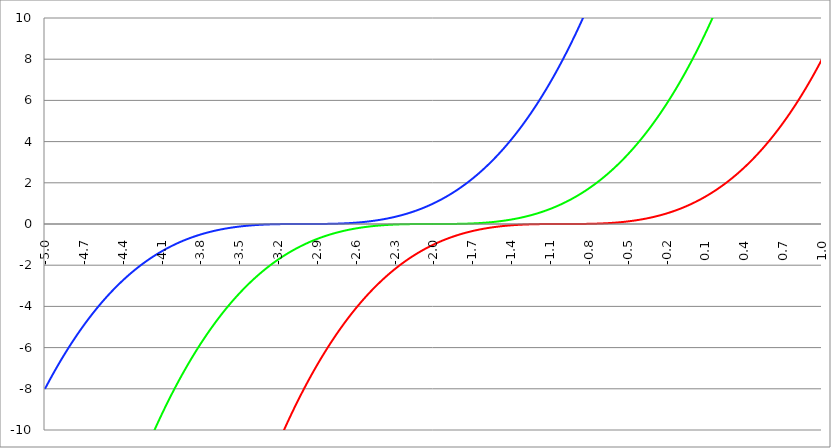
| Category | Series 1 | Series 0 | Series 2 |
|---|---|---|---|
| -5.0 | -64 | -27 | -8 |
| -4.997 | -63.856 | -26.919 | -7.964 |
| -4.994 | -63.712 | -26.838 | -7.928 |
| -4.991 | -63.569 | -26.758 | -7.892 |
| -4.988 | -63.426 | -26.677 | -7.857 |
| -4.984999999999999 | -63.283 | -26.597 | -7.821 |
| -4.982 | -63.14 | -26.517 | -7.786 |
| -4.979 | -62.997 | -26.437 | -7.751 |
| -4.976 | -62.855 | -26.357 | -7.715 |
| -4.972999999999999 | -62.713 | -26.278 | -7.68 |
| -4.969999999999999 | -62.571 | -26.198 | -7.645 |
| -4.966999999999999 | -62.429 | -26.119 | -7.61 |
| -4.963999999999999 | -62.288 | -26.04 | -7.576 |
| -4.960999999999998 | -62.146 | -25.961 | -7.541 |
| -4.957999999999998 | -62.005 | -25.882 | -7.507 |
| -4.954999999999998 | -61.864 | -25.803 | -7.472 |
| -4.951999999999998 | -61.724 | -25.725 | -7.438 |
| -4.948999999999998 | -61.583 | -25.646 | -7.403 |
| -4.945999999999998 | -61.443 | -25.568 | -7.369 |
| -4.942999999999998 | -61.303 | -25.49 | -7.335 |
| -4.939999999999997 | -61.163 | -25.412 | -7.301 |
| -4.936999999999997 | -61.023 | -25.334 | -7.268 |
| -4.933999999999997 | -60.884 | -25.257 | -7.234 |
| -4.930999999999997 | -60.745 | -25.18 | -7.2 |
| -4.927999999999997 | -60.606 | -25.102 | -7.167 |
| -4.924999999999997 | -60.467 | -25.025 | -7.133 |
| -4.921999999999997 | -60.329 | -24.948 | -7.1 |
| -4.918999999999997 | -60.19 | -24.872 | -7.067 |
| -4.915999999999997 | -60.052 | -24.795 | -7.034 |
| -4.912999999999997 | -59.914 | -24.718 | -7.001 |
| -4.909999999999996 | -59.776 | -24.642 | -6.968 |
| -4.906999999999996 | -59.639 | -24.566 | -6.935 |
| -4.903999999999996 | -59.502 | -24.49 | -6.902 |
| -4.900999999999996 | -59.365 | -24.414 | -6.87 |
| -4.897999999999996 | -59.228 | -24.339 | -6.837 |
| -4.894999999999996 | -59.091 | -24.263 | -6.805 |
| -4.891999999999996 | -58.955 | -24.188 | -6.773 |
| -4.888999999999996 | -58.818 | -24.113 | -6.741 |
| -4.885999999999996 | -58.682 | -24.037 | -6.708 |
| -4.882999999999996 | -58.547 | -23.963 | -6.677 |
| -4.879999999999995 | -58.411 | -23.888 | -6.645 |
| -4.876999999999995 | -58.276 | -23.813 | -6.613 |
| -4.873999999999995 | -58.141 | -23.739 | -6.581 |
| -4.870999999999995 | -58.006 | -23.665 | -6.55 |
| -4.867999999999995 | -57.871 | -23.591 | -6.518 |
| -4.864999999999995 | -57.736 | -23.517 | -6.487 |
| -4.861999999999995 | -57.602 | -23.443 | -6.456 |
| -4.858999999999995 | -57.468 | -23.369 | -6.424 |
| -4.855999999999994 | -57.334 | -23.296 | -6.393 |
| -4.852999999999994 | -57.2 | -23.222 | -6.362 |
| -4.849999999999994 | -57.067 | -23.149 | -6.332 |
| -4.846999999999994 | -56.933 | -23.076 | -6.301 |
| -4.843999999999994 | -56.8 | -23.003 | -6.27 |
| -4.840999999999994 | -56.667 | -22.931 | -6.24 |
| -4.837999999999994 | -56.535 | -22.858 | -6.209 |
| -4.834999999999994 | -56.402 | -22.786 | -6.179 |
| -4.831999999999994 | -56.27 | -22.713 | -6.149 |
| -4.828999999999993 | -56.138 | -22.641 | -6.118 |
| -4.825999999999993 | -56.006 | -22.569 | -6.088 |
| -4.822999999999993 | -55.874 | -22.497 | -6.058 |
| -4.819999999999993 | -55.743 | -22.426 | -6.029 |
| -4.816999999999993 | -55.612 | -22.354 | -5.999 |
| -4.813999999999993 | -55.481 | -22.283 | -5.969 |
| -4.810999999999993 | -55.35 | -22.212 | -5.94 |
| -4.807999999999993 | -55.219 | -22.141 | -5.91 |
| -4.804999999999993 | -55.089 | -22.07 | -5.881 |
| -4.801999999999992 | -54.959 | -21.999 | -5.851 |
| -4.798999999999992 | -54.829 | -21.928 | -5.822 |
| -4.795999999999992 | -54.699 | -21.858 | -5.793 |
| -4.792999999999992 | -54.569 | -21.788 | -5.764 |
| -4.789999999999992 | -54.44 | -21.718 | -5.735 |
| -4.786999999999992 | -54.311 | -21.648 | -5.707 |
| -4.783999999999992 | -54.182 | -21.578 | -5.678 |
| -4.780999999999992 | -54.053 | -21.508 | -5.649 |
| -4.777999999999992 | -53.924 | -21.439 | -5.621 |
| -4.774999999999991 | -53.796 | -21.369 | -5.592 |
| -4.771999999999991 | -53.668 | -21.3 | -5.564 |
| -4.768999999999991 | -53.54 | -21.231 | -5.536 |
| -4.765999999999991 | -53.412 | -21.162 | -5.508 |
| -4.762999999999991 | -53.285 | -21.093 | -5.48 |
| -4.759999999999991 | -53.157 | -21.025 | -5.452 |
| -4.756999999999991 | -53.03 | -20.956 | -5.424 |
| -4.753999999999991 | -52.903 | -20.888 | -5.396 |
| -4.75099999999999 | -52.777 | -20.82 | -5.369 |
| -4.74799999999999 | -52.65 | -20.752 | -5.341 |
| -4.74499999999999 | -52.524 | -20.684 | -5.314 |
| -4.74199999999999 | -52.398 | -20.616 | -5.286 |
| -4.73899999999999 | -52.272 | -20.548 | -5.259 |
| -4.73599999999999 | -52.146 | -20.481 | -5.232 |
| -4.73299999999999 | -52.02 | -20.414 | -5.205 |
| -4.72999999999999 | -51.895 | -20.346 | -5.178 |
| -4.72699999999999 | -51.77 | -20.279 | -5.151 |
| -4.723999999999989 | -51.645 | -20.213 | -5.124 |
| -4.720999999999989 | -51.52 | -20.146 | -5.097 |
| -4.717999999999989 | -51.396 | -20.079 | -5.071 |
| -4.714999999999989 | -51.272 | -20.013 | -5.044 |
| -4.71199999999999 | -51.147 | -19.947 | -5.018 |
| -4.708999999999989 | -51.024 | -19.88 | -4.991 |
| -4.705999999999989 | -50.9 | -19.815 | -4.965 |
| -4.702999999999989 | -50.776 | -19.749 | -4.939 |
| -4.699999999999989 | -50.653 | -19.683 | -4.913 |
| -4.696999999999988 | -50.53 | -19.617 | -4.887 |
| -4.693999999999988 | -50.407 | -19.552 | -4.861 |
| -4.690999999999988 | -50.284 | -19.487 | -4.835 |
| -4.687999999999988 | -50.162 | -19.422 | -4.81 |
| -4.684999999999988 | -50.039 | -19.357 | -4.784 |
| -4.681999999999988 | -49.917 | -19.292 | -4.759 |
| -4.678999999999988 | -49.795 | -19.227 | -4.733 |
| -4.675999999999988 | -49.674 | -19.163 | -4.708 |
| -4.672999999999988 | -49.552 | -19.098 | -4.683 |
| -4.669999999999987 | -49.431 | -19.034 | -4.657 |
| -4.666999999999987 | -49.31 | -18.97 | -4.632 |
| -4.663999999999987 | -49.189 | -18.906 | -4.607 |
| -4.660999999999987 | -49.068 | -18.842 | -4.583 |
| -4.657999999999987 | -48.948 | -18.779 | -4.558 |
| -4.654999999999987 | -48.827 | -18.715 | -4.533 |
| -4.651999999999987 | -48.707 | -18.652 | -4.508 |
| -4.648999999999987 | -48.587 | -18.589 | -4.484 |
| -4.645999999999986 | -48.467 | -18.525 | -4.46 |
| -4.642999999999986 | -48.348 | -18.463 | -4.435 |
| -4.639999999999986 | -48.229 | -18.4 | -4.411 |
| -4.636999999999986 | -48.109 | -18.337 | -4.387 |
| -4.633999999999986 | -47.99 | -18.275 | -4.363 |
| -4.630999999999986 | -47.872 | -18.212 | -4.339 |
| -4.627999999999986 | -47.753 | -18.15 | -4.315 |
| -4.624999999999986 | -47.635 | -18.088 | -4.291 |
| -4.621999999999986 | -47.517 | -18.026 | -4.267 |
| -4.618999999999985 | -47.399 | -17.964 | -4.244 |
| -4.615999999999985 | -47.281 | -17.902 | -4.22 |
| -4.612999999999985 | -47.163 | -17.841 | -4.197 |
| -4.609999999999985 | -47.046 | -17.78 | -4.173 |
| -4.606999999999985 | -46.929 | -17.718 | -4.15 |
| -4.603999999999985 | -46.812 | -17.657 | -4.127 |
| -4.600999999999985 | -46.695 | -17.596 | -4.104 |
| -4.597999999999985 | -46.578 | -17.535 | -4.081 |
| -4.594999999999985 | -46.462 | -17.475 | -4.058 |
| -4.591999999999984 | -46.346 | -17.414 | -4.035 |
| -4.588999999999984 | -46.23 | -17.354 | -4.012 |
| -4.585999999999984 | -46.114 | -17.294 | -3.989 |
| -4.582999999999984 | -45.998 | -17.233 | -3.967 |
| -4.579999999999984 | -45.883 | -17.174 | -3.944 |
| -4.576999999999984 | -45.767 | -17.114 | -3.922 |
| -4.573999999999984 | -45.652 | -17.054 | -3.9 |
| -4.570999999999984 | -45.538 | -16.994 | -3.877 |
| -4.567999999999984 | -45.423 | -16.935 | -3.855 |
| -4.564999999999984 | -45.308 | -16.876 | -3.833 |
| -4.561999999999983 | -45.194 | -16.817 | -3.811 |
| -4.558999999999983 | -45.08 | -16.758 | -3.789 |
| -4.555999999999983 | -44.966 | -16.699 | -3.767 |
| -4.552999999999983 | -44.852 | -16.64 | -3.746 |
| -4.549999999999983 | -44.739 | -16.581 | -3.724 |
| -4.546999999999983 | -44.626 | -16.523 | -3.702 |
| -4.543999999999983 | -44.512 | -16.465 | -3.681 |
| -4.540999999999983 | -44.399 | -16.406 | -3.659 |
| -4.537999999999982 | -44.287 | -16.348 | -3.638 |
| -4.534999999999982 | -44.174 | -16.29 | -3.617 |
| -4.531999999999982 | -44.062 | -16.233 | -3.596 |
| -4.528999999999982 | -43.95 | -16.175 | -3.575 |
| -4.525999999999982 | -43.838 | -16.118 | -3.554 |
| -4.522999999999982 | -43.726 | -16.06 | -3.533 |
| -4.519999999999982 | -43.614 | -16.003 | -3.512 |
| -4.516999999999982 | -43.503 | -15.946 | -3.491 |
| -4.513999999999982 | -43.392 | -15.889 | -3.47 |
| -4.510999999999981 | -43.281 | -15.832 | -3.45 |
| -4.507999999999981 | -43.17 | -15.775 | -3.429 |
| -4.504999999999981 | -43.059 | -15.719 | -3.409 |
| -4.501999999999981 | -42.949 | -15.663 | -3.389 |
| -4.498999999999981 | -42.838 | -15.606 | -3.368 |
| -4.495999999999981 | -42.728 | -15.55 | -3.348 |
| -4.492999999999981 | -42.618 | -15.494 | -3.328 |
| -4.48999999999998 | -42.509 | -15.438 | -3.308 |
| -4.48699999999998 | -42.399 | -15.383 | -3.288 |
| -4.48399999999998 | -42.29 | -15.327 | -3.268 |
| -4.48099999999998 | -42.181 | -15.271 | -3.248 |
| -4.47799999999998 | -42.072 | -15.216 | -3.229 |
| -4.47499999999998 | -41.963 | -15.161 | -3.209 |
| -4.47199999999998 | -41.854 | -15.106 | -3.19 |
| -4.46899999999998 | -41.746 | -15.051 | -3.17 |
| -4.46599999999998 | -41.638 | -14.996 | -3.151 |
| -4.46299999999998 | -41.53 | -14.941 | -3.131 |
| -4.45999999999998 | -41.422 | -14.887 | -3.112 |
| -4.45699999999998 | -41.314 | -14.833 | -3.093 |
| -4.45399999999998 | -41.207 | -14.778 | -3.074 |
| -4.45099999999998 | -41.099 | -14.724 | -3.055 |
| -4.44799999999998 | -40.992 | -14.67 | -3.036 |
| -4.444999999999979 | -40.885 | -14.616 | -3.017 |
| -4.441999999999978 | -40.779 | -14.563 | -2.998 |
| -4.438999999999978 | -40.672 | -14.509 | -2.98 |
| -4.435999999999978 | -40.566 | -14.455 | -2.961 |
| -4.432999999999978 | -40.46 | -14.402 | -2.943 |
| -4.429999999999978 | -40.354 | -14.349 | -2.924 |
| -4.426999999999978 | -40.248 | -14.296 | -2.906 |
| -4.423999999999978 | -40.142 | -14.243 | -2.888 |
| -4.420999999999978 | -40.037 | -14.19 | -2.869 |
| -4.417999999999978 | -39.932 | -14.137 | -2.851 |
| -4.414999999999978 | -39.826 | -14.085 | -2.833 |
| -4.411999999999977 | -39.722 | -14.032 | -2.815 |
| -4.408999999999977 | -39.617 | -13.98 | -2.797 |
| -4.405999999999977 | -39.512 | -13.928 | -2.779 |
| -4.402999999999977 | -39.408 | -13.876 | -2.762 |
| -4.399999999999977 | -39.304 | -13.824 | -2.744 |
| -4.396999999999977 | -39.2 | -13.772 | -2.726 |
| -4.393999999999977 | -39.096 | -13.721 | -2.709 |
| -4.390999999999977 | -38.993 | -13.669 | -2.691 |
| -4.387999999999977 | -38.889 | -13.618 | -2.674 |
| -4.384999999999977 | -38.786 | -13.566 | -2.657 |
| -4.381999999999976 | -38.683 | -13.515 | -2.64 |
| -4.378999999999976 | -38.58 | -13.464 | -2.622 |
| -4.375999999999976 | -38.478 | -13.413 | -2.605 |
| -4.372999999999976 | -38.375 | -13.363 | -2.588 |
| -4.369999999999976 | -38.273 | -13.312 | -2.571 |
| -4.366999999999976 | -38.171 | -13.262 | -2.554 |
| -4.363999999999976 | -38.069 | -13.211 | -2.538 |
| -4.360999999999976 | -37.967 | -13.161 | -2.521 |
| -4.357999999999976 | -37.865 | -13.111 | -2.504 |
| -4.354999999999976 | -37.764 | -13.061 | -2.488 |
| -4.351999999999975 | -37.663 | -13.011 | -2.471 |
| -4.348999999999975 | -37.562 | -12.961 | -2.455 |
| -4.345999999999975 | -37.461 | -12.912 | -2.439 |
| -4.342999999999975 | -37.36 | -12.862 | -2.422 |
| -4.339999999999974 | -37.26 | -12.813 | -2.406 |
| -4.336999999999974 | -37.159 | -12.764 | -2.39 |
| -4.333999999999974 | -37.059 | -12.715 | -2.374 |
| -4.330999999999974 | -36.959 | -12.666 | -2.358 |
| -4.327999999999974 | -36.86 | -12.617 | -2.342 |
| -4.324999999999974 | -36.76 | -12.568 | -2.326 |
| -4.321999999999974 | -36.661 | -12.519 | -2.31 |
| -4.318999999999974 | -36.561 | -12.471 | -2.295 |
| -4.315999999999974 | -36.462 | -12.423 | -2.279 |
| -4.312999999999974 | -36.363 | -12.374 | -2.264 |
| -4.309999999999974 | -36.265 | -12.326 | -2.248 |
| -4.306999999999974 | -36.166 | -12.278 | -2.233 |
| -4.303999999999974 | -36.068 | -12.231 | -2.217 |
| -4.300999999999973 | -35.97 | -12.183 | -2.202 |
| -4.297999999999973 | -35.872 | -12.135 | -2.187 |
| -4.294999999999973 | -35.774 | -12.088 | -2.172 |
| -4.291999999999973 | -35.676 | -12.04 | -2.157 |
| -4.288999999999973 | -35.579 | -11.993 | -2.142 |
| -4.285999999999973 | -35.482 | -11.946 | -2.127 |
| -4.282999999999973 | -35.384 | -11.899 | -2.112 |
| -4.279999999999972 | -35.288 | -11.852 | -2.097 |
| -4.276999999999972 | -35.191 | -11.806 | -2.082 |
| -4.273999999999972 | -35.094 | -11.759 | -2.068 |
| -4.270999999999972 | -34.998 | -11.713 | -2.053 |
| -4.267999999999972 | -34.902 | -11.666 | -2.039 |
| -4.264999999999972 | -34.806 | -11.62 | -2.024 |
| -4.261999999999972 | -34.71 | -11.574 | -2.01 |
| -4.258999999999972 | -34.614 | -11.528 | -1.996 |
| -4.255999999999972 | -34.519 | -11.482 | -1.981 |
| -4.252999999999972 | -34.423 | -11.436 | -1.967 |
| -4.249999999999971 | -34.328 | -11.391 | -1.953 |
| -4.246999999999971 | -34.233 | -11.345 | -1.939 |
| -4.243999999999971 | -34.138 | -11.3 | -1.925 |
| -4.240999999999971 | -34.044 | -11.254 | -1.911 |
| -4.237999999999971 | -33.949 | -11.209 | -1.897 |
| -4.234999999999971 | -33.855 | -11.164 | -1.884 |
| -4.23199999999997 | -33.761 | -11.119 | -1.87 |
| -4.228999999999971 | -33.667 | -11.075 | -1.856 |
| -4.225999999999971 | -33.573 | -11.03 | -1.843 |
| -4.222999999999971 | -33.48 | -10.985 | -1.829 |
| -4.21999999999997 | -33.386 | -10.941 | -1.816 |
| -4.21699999999997 | -33.293 | -10.897 | -1.802 |
| -4.21399999999997 | -33.2 | -10.853 | -1.789 |
| -4.21099999999997 | -33.107 | -10.809 | -1.776 |
| -4.20799999999997 | -33.014 | -10.765 | -1.763 |
| -4.20499999999997 | -32.922 | -10.721 | -1.75 |
| -4.20199999999997 | -32.829 | -10.677 | -1.737 |
| -4.19899999999997 | -32.737 | -10.633 | -1.724 |
| -4.19599999999997 | -32.645 | -10.59 | -1.711 |
| -4.192999999999969 | -32.553 | -10.547 | -1.698 |
| -4.18999999999997 | -32.462 | -10.503 | -1.685 |
| -4.18699999999997 | -32.37 | -10.46 | -1.672 |
| -4.18399999999997 | -32.279 | -10.417 | -1.66 |
| -4.180999999999969 | -32.188 | -10.374 | -1.647 |
| -4.177999999999969 | -32.097 | -10.332 | -1.635 |
| -4.174999999999969 | -32.006 | -10.289 | -1.622 |
| -4.171999999999968 | -31.915 | -10.247 | -1.61 |
| -4.168999999999968 | -31.825 | -10.204 | -1.598 |
| -4.165999999999968 | -31.735 | -10.162 | -1.585 |
| -4.162999999999968 | -31.644 | -10.12 | -1.573 |
| -4.159999999999968 | -31.554 | -10.078 | -1.561 |
| -4.156999999999968 | -31.465 | -10.036 | -1.549 |
| -4.153999999999968 | -31.375 | -9.994 | -1.537 |
| -4.150999999999968 | -31.286 | -9.952 | -1.525 |
| -4.147999999999968 | -31.196 | -9.911 | -1.513 |
| -4.144999999999968 | -31.107 | -9.869 | -1.501 |
| -4.141999999999967 | -31.018 | -9.828 | -1.489 |
| -4.138999999999967 | -30.93 | -9.787 | -1.478 |
| -4.135999999999967 | -30.841 | -9.745 | -1.466 |
| -4.132999999999967 | -30.753 | -9.704 | -1.454 |
| -4.129999999999967 | -30.664 | -9.664 | -1.443 |
| -4.126999999999967 | -30.576 | -9.623 | -1.431 |
| -4.123999999999967 | -30.488 | -9.582 | -1.42 |
| -4.120999999999967 | -30.401 | -9.542 | -1.409 |
| -4.117999999999967 | -30.313 | -9.501 | -1.397 |
| -4.114999999999966 | -30.226 | -9.461 | -1.386 |
| -4.111999999999966 | -30.138 | -9.421 | -1.375 |
| -4.108999999999966 | -30.051 | -9.381 | -1.364 |
| -4.105999999999966 | -29.964 | -9.341 | -1.353 |
| -4.102999999999966 | -29.878 | -9.301 | -1.342 |
| -4.099999999999965 | -29.791 | -9.261 | -1.331 |
| -4.096999999999965 | -29.705 | -9.221 | -1.32 |
| -4.093999999999965 | -29.618 | -9.182 | -1.309 |
| -4.090999999999965 | -29.532 | -9.142 | -1.299 |
| -4.087999999999965 | -29.446 | -9.103 | -1.288 |
| -4.084999999999965 | -29.361 | -9.064 | -1.277 |
| -4.081999999999965 | -29.275 | -9.025 | -1.267 |
| -4.078999999999965 | -29.19 | -8.986 | -1.256 |
| -4.075999999999964 | -29.104 | -8.947 | -1.246 |
| -4.072999999999964 | -29.019 | -8.908 | -1.235 |
| -4.069999999999964 | -28.934 | -8.87 | -1.225 |
| -4.066999999999964 | -28.85 | -8.831 | -1.215 |
| -4.063999999999964 | -28.765 | -8.793 | -1.205 |
| -4.060999999999964 | -28.681 | -8.755 | -1.194 |
| -4.057999999999964 | -28.596 | -8.716 | -1.184 |
| -4.054999999999964 | -28.512 | -8.678 | -1.174 |
| -4.051999999999964 | -28.428 | -8.64 | -1.164 |
| -4.048999999999964 | -28.345 | -8.603 | -1.154 |
| -4.045999999999964 | -28.261 | -8.565 | -1.144 |
| -4.042999999999964 | -28.178 | -8.527 | -1.135 |
| -4.039999999999963 | -28.094 | -8.49 | -1.125 |
| -4.036999999999963 | -28.011 | -8.452 | -1.115 |
| -4.033999999999963 | -27.928 | -8.415 | -1.106 |
| -4.030999999999963 | -27.846 | -8.378 | -1.096 |
| -4.027999999999963 | -27.763 | -8.341 | -1.086 |
| -4.024999999999963 | -27.681 | -8.304 | -1.077 |
| -4.021999999999963 | -27.598 | -8.267 | -1.067 |
| -4.018999999999963 | -27.516 | -8.23 | -1.058 |
| -4.015999999999963 | -27.434 | -8.194 | -1.049 |
| -4.012999999999963 | -27.353 | -8.157 | -1.04 |
| -4.009999999999962 | -27.271 | -8.121 | -1.03 |
| -4.006999999999962 | -27.189 | -8.084 | -1.021 |
| -4.003999999999962 | -27.108 | -8.048 | -1.012 |
| -4.000999999999962 | -27.027 | -8.012 | -1.003 |
| -3.997999999999962 | -26.946 | -7.976 | -0.994 |
| -3.994999999999962 | -26.865 | -7.94 | -0.985 |
| -3.991999999999962 | -26.785 | -7.904 | -0.976 |
| -3.988999999999962 | -26.704 | -7.869 | -0.967 |
| -3.985999999999962 | -26.624 | -7.833 | -0.959 |
| -3.982999999999961 | -26.544 | -7.798 | -0.95 |
| -3.979999999999961 | -26.464 | -7.762 | -0.941 |
| -3.976999999999961 | -26.384 | -7.727 | -0.933 |
| -3.973999999999961 | -26.304 | -7.692 | -0.924 |
| -3.970999999999961 | -26.225 | -7.657 | -0.915 |
| -3.967999999999961 | -26.145 | -7.622 | -0.907 |
| -3.964999999999961 | -26.066 | -7.587 | -0.899 |
| -3.961999999999961 | -25.987 | -7.553 | -0.89 |
| -3.958999999999961 | -25.908 | -7.518 | -0.882 |
| -3.95599999999996 | -25.829 | -7.484 | -0.874 |
| -3.95299999999996 | -25.751 | -7.449 | -0.866 |
| -3.94999999999996 | -25.672 | -7.415 | -0.857 |
| -3.94699999999996 | -25.594 | -7.381 | -0.849 |
| -3.94399999999996 | -25.516 | -7.347 | -0.841 |
| -3.94099999999996 | -25.438 | -7.313 | -0.833 |
| -3.93799999999996 | -25.36 | -7.279 | -0.825 |
| -3.93499999999996 | -25.283 | -7.245 | -0.817 |
| -3.931999999999959 | -25.205 | -7.211 | -0.81 |
| -3.928999999999959 | -25.128 | -7.178 | -0.802 |
| -3.925999999999959 | -25.051 | -7.144 | -0.794 |
| -3.922999999999959 | -24.974 | -7.111 | -0.786 |
| -3.919999999999959 | -24.897 | -7.078 | -0.779 |
| -3.916999999999959 | -24.82 | -7.045 | -0.771 |
| -3.913999999999959 | -24.744 | -7.012 | -0.764 |
| -3.910999999999959 | -24.668 | -6.979 | -0.756 |
| -3.907999999999959 | -24.591 | -6.946 | -0.749 |
| -3.904999999999958 | -24.515 | -6.913 | -0.741 |
| -3.901999999999958 | -24.439 | -6.881 | -0.734 |
| -3.898999999999958 | -24.364 | -6.848 | -0.727 |
| -3.895999999999958 | -24.288 | -6.816 | -0.719 |
| -3.892999999999958 | -24.213 | -6.783 | -0.712 |
| -3.889999999999958 | -24.138 | -6.751 | -0.705 |
| -3.886999999999958 | -24.062 | -6.719 | -0.698 |
| -3.883999999999958 | -23.988 | -6.687 | -0.691 |
| -3.880999999999958 | -23.913 | -6.655 | -0.684 |
| -3.877999999999957 | -23.838 | -6.623 | -0.677 |
| -3.874999999999957 | -23.764 | -6.592 | -0.67 |
| -3.871999999999957 | -23.689 | -6.56 | -0.663 |
| -3.868999999999957 | -23.615 | -6.529 | -0.656 |
| -3.865999999999957 | -23.541 | -6.497 | -0.649 |
| -3.862999999999957 | -23.467 | -6.466 | -0.643 |
| -3.859999999999957 | -23.394 | -6.435 | -0.636 |
| -3.856999999999957 | -23.32 | -6.404 | -0.629 |
| -3.853999999999957 | -23.247 | -6.373 | -0.623 |
| -3.850999999999956 | -23.174 | -6.342 | -0.616 |
| -3.847999999999956 | -23.1 | -6.311 | -0.61 |
| -3.844999999999956 | -23.028 | -6.28 | -0.603 |
| -3.841999999999956 | -22.955 | -6.25 | -0.597 |
| -3.838999999999956 | -22.882 | -6.219 | -0.591 |
| -3.835999999999956 | -22.81 | -6.189 | -0.584 |
| -3.832999999999956 | -22.737 | -6.159 | -0.578 |
| -3.829999999999956 | -22.665 | -6.128 | -0.572 |
| -3.826999999999955 | -22.593 | -6.098 | -0.566 |
| -3.823999999999955 | -22.521 | -6.068 | -0.559 |
| -3.820999999999955 | -22.45 | -6.039 | -0.553 |
| -3.817999999999955 | -22.378 | -6.009 | -0.547 |
| -3.814999999999955 | -22.307 | -5.979 | -0.541 |
| -3.811999999999955 | -22.235 | -5.949 | -0.535 |
| -3.808999999999955 | -22.164 | -5.92 | -0.529 |
| -3.805999999999955 | -22.093 | -5.891 | -0.524 |
| -3.802999999999955 | -22.023 | -5.861 | -0.518 |
| -3.799999999999954 | -21.952 | -5.832 | -0.512 |
| -3.796999999999954 | -21.882 | -5.803 | -0.506 |
| -3.793999999999954 | -21.811 | -5.774 | -0.501 |
| -3.790999999999954 | -21.741 | -5.745 | -0.495 |
| -3.787999999999954 | -21.671 | -5.716 | -0.489 |
| -3.784999999999954 | -21.601 | -5.687 | -0.484 |
| -3.781999999999954 | -21.531 | -5.659 | -0.478 |
| -3.778999999999954 | -21.462 | -5.63 | -0.473 |
| -3.775999999999954 | -21.392 | -5.602 | -0.467 |
| -3.772999999999953 | -21.323 | -5.573 | -0.462 |
| -3.769999999999953 | -21.254 | -5.545 | -0.457 |
| -3.766999999999953 | -21.185 | -5.517 | -0.451 |
| -3.763999999999953 | -21.116 | -5.489 | -0.446 |
| -3.760999999999953 | -21.047 | -5.461 | -0.441 |
| -3.757999999999953 | -20.979 | -5.433 | -0.436 |
| -3.754999999999953 | -20.911 | -5.405 | -0.43 |
| -3.751999999999953 | -20.842 | -5.378 | -0.425 |
| -3.748999999999952 | -20.774 | -5.35 | -0.42 |
| -3.745999999999952 | -20.706 | -5.323 | -0.415 |
| -3.742999999999952 | -20.638 | -5.295 | -0.41 |
| -3.739999999999952 | -20.571 | -5.268 | -0.405 |
| -3.736999999999952 | -20.503 | -5.241 | -0.4 |
| -3.733999999999952 | -20.436 | -5.214 | -0.395 |
| -3.730999999999952 | -20.369 | -5.187 | -0.391 |
| -3.727999999999952 | -20.302 | -5.16 | -0.386 |
| -3.724999999999952 | -20.235 | -5.133 | -0.381 |
| -3.721999999999951 | -20.168 | -5.106 | -0.376 |
| -3.718999999999951 | -20.101 | -5.08 | -0.372 |
| -3.715999999999951 | -20.035 | -5.053 | -0.367 |
| -3.712999999999951 | -19.969 | -5.027 | -0.362 |
| -3.709999999999951 | -19.903 | -5 | -0.358 |
| -3.706999999999951 | -19.836 | -4.974 | -0.353 |
| -3.703999999999951 | -19.771 | -4.948 | -0.349 |
| -3.700999999999951 | -19.705 | -4.922 | -0.344 |
| -3.697999999999951 | -19.639 | -4.896 | -0.34 |
| -3.69499999999995 | -19.574 | -4.87 | -0.336 |
| -3.69199999999995 | -19.509 | -4.844 | -0.331 |
| -3.68899999999995 | -19.443 | -4.818 | -0.327 |
| -3.68599999999995 | -19.378 | -4.793 | -0.323 |
| -3.68299999999995 | -19.314 | -4.767 | -0.319 |
| -3.67999999999995 | -19.249 | -4.742 | -0.314 |
| -3.67699999999995 | -19.184 | -4.716 | -0.31 |
| -3.67399999999995 | -19.12 | -4.691 | -0.306 |
| -3.67099999999995 | -19.056 | -4.666 | -0.302 |
| -3.667999999999949 | -18.991 | -4.641 | -0.298 |
| -3.664999999999949 | -18.927 | -4.616 | -0.294 |
| -3.661999999999949 | -18.864 | -4.591 | -0.29 |
| -3.658999999999949 | -18.8 | -4.566 | -0.286 |
| -3.655999999999949 | -18.736 | -4.541 | -0.282 |
| -3.652999999999949 | -18.673 | -4.517 | -0.278 |
| -3.649999999999949 | -18.61 | -4.492 | -0.275 |
| -3.646999999999949 | -18.546 | -4.468 | -0.271 |
| -3.643999999999949 | -18.484 | -4.443 | -0.267 |
| -3.640999999999948 | -18.421 | -4.419 | -0.263 |
| -3.637999999999948 | -18.358 | -4.395 | -0.26 |
| -3.634999999999948 | -18.295 | -4.371 | -0.256 |
| -3.631999999999948 | -18.233 | -4.347 | -0.252 |
| -3.628999999999948 | -18.171 | -4.323 | -0.249 |
| -3.625999999999948 | -18.109 | -4.299 | -0.245 |
| -3.622999999999948 | -18.047 | -4.275 | -0.242 |
| -3.619999999999948 | -17.985 | -4.252 | -0.238 |
| -3.616999999999947 | -17.923 | -4.228 | -0.235 |
| -3.613999999999947 | -17.861 | -4.204 | -0.231 |
| -3.610999999999947 | -17.8 | -4.181 | -0.228 |
| -3.607999999999947 | -17.739 | -4.158 | -0.225 |
| -3.604999999999947 | -17.678 | -4.135 | -0.221 |
| -3.601999999999947 | -17.617 | -4.111 | -0.218 |
| -3.598999999999947 | -17.556 | -4.088 | -0.215 |
| -3.595999999999947 | -17.495 | -4.065 | -0.212 |
| -3.592999999999947 | -17.434 | -4.042 | -0.209 |
| -3.589999999999947 | -17.374 | -4.02 | -0.205 |
| -3.586999999999946 | -17.314 | -3.997 | -0.202 |
| -3.583999999999946 | -17.254 | -3.974 | -0.199 |
| -3.580999999999946 | -17.193 | -3.952 | -0.196 |
| -3.577999999999946 | -17.134 | -3.929 | -0.193 |
| -3.574999999999946 | -17.074 | -3.907 | -0.19 |
| -3.571999999999946 | -17.014 | -3.885 | -0.187 |
| -3.568999999999946 | -16.955 | -3.863 | -0.184 |
| -3.565999999999946 | -16.895 | -3.84 | -0.181 |
| -3.562999999999946 | -16.836 | -3.818 | -0.178 |
| -3.559999999999945 | -16.777 | -3.796 | -0.176 |
| -3.556999999999945 | -16.718 | -3.775 | -0.173 |
| -3.553999999999945 | -16.66 | -3.753 | -0.17 |
| -3.550999999999945 | -16.601 | -3.731 | -0.167 |
| -3.547999999999945 | -16.542 | -3.709 | -0.165 |
| -3.544999999999945 | -16.484 | -3.688 | -0.162 |
| -3.541999999999945 | -16.426 | -3.667 | -0.159 |
| -3.538999999999945 | -16.368 | -3.645 | -0.157 |
| -3.535999999999945 | -16.31 | -3.624 | -0.154 |
| -3.532999999999944 | -16.252 | -3.603 | -0.151 |
| -3.529999999999944 | -16.194 | -3.582 | -0.149 |
| -3.526999999999944 | -16.137 | -3.561 | -0.146 |
| -3.523999999999944 | -16.079 | -3.54 | -0.144 |
| -3.520999999999944 | -16.022 | -3.519 | -0.141 |
| -3.517999999999944 | -15.965 | -3.498 | -0.139 |
| -3.514999999999944 | -15.908 | -3.477 | -0.137 |
| -3.511999999999944 | -15.851 | -3.457 | -0.134 |
| -3.508999999999943 | -15.794 | -3.436 | -0.132 |
| -3.505999999999943 | -15.738 | -3.416 | -0.13 |
| -3.502999999999943 | -15.681 | -3.395 | -0.127 |
| -3.499999999999943 | -15.625 | -3.375 | -0.125 |
| -3.496999999999943 | -15.569 | -3.355 | -0.123 |
| -3.493999999999943 | -15.513 | -3.335 | -0.121 |
| -3.490999999999943 | -15.457 | -3.315 | -0.118 |
| -3.487999999999943 | -15.401 | -3.295 | -0.116 |
| -3.484999999999943 | -15.345 | -3.275 | -0.114 |
| -3.481999999999942 | -15.29 | -3.255 | -0.112 |
| -3.478999999999942 | -15.235 | -3.235 | -0.11 |
| -3.475999999999942 | -15.179 | -3.216 | -0.108 |
| -3.472999999999942 | -15.124 | -3.196 | -0.106 |
| -3.469999999999942 | -15.069 | -3.177 | -0.104 |
| -3.466999999999942 | -15.014 | -3.157 | -0.102 |
| -3.463999999999942 | -14.96 | -3.138 | -0.1 |
| -3.460999999999942 | -14.905 | -3.119 | -0.098 |
| -3.457999999999942 | -14.851 | -3.099 | -0.096 |
| -3.454999999999941 | -14.796 | -3.08 | -0.094 |
| -3.451999999999941 | -14.742 | -3.061 | -0.092 |
| -3.448999999999941 | -14.688 | -3.042 | -0.091 |
| -3.445999999999941 | -14.634 | -3.023 | -0.089 |
| -3.442999999999941 | -14.58 | -3.005 | -0.087 |
| -3.439999999999941 | -14.527 | -2.986 | -0.085 |
| -3.436999999999941 | -14.473 | -2.967 | -0.083 |
| -3.433999999999941 | -14.42 | -2.949 | -0.082 |
| -3.430999999999941 | -14.367 | -2.93 | -0.08 |
| -3.42799999999994 | -14.314 | -2.912 | -0.078 |
| -3.42499999999994 | -14.261 | -2.894 | -0.077 |
| -3.42199999999994 | -14.208 | -2.875 | -0.075 |
| -3.41899999999994 | -14.155 | -2.857 | -0.074 |
| -3.41599999999994 | -14.102 | -2.839 | -0.072 |
| -3.41299999999994 | -14.05 | -2.821 | -0.07 |
| -3.40999999999994 | -13.998 | -2.803 | -0.069 |
| -3.40699999999994 | -13.945 | -2.785 | -0.067 |
| -3.403999999999939 | -13.893 | -2.768 | -0.066 |
| -3.400999999999939 | -13.841 | -2.75 | -0.064 |
| -3.397999999999939 | -13.789 | -2.732 | -0.063 |
| -3.394999999999939 | -13.738 | -2.715 | -0.062 |
| -3.391999999999939 | -13.686 | -2.697 | -0.06 |
| -3.388999999999939 | -13.635 | -2.68 | -0.059 |
| -3.385999999999939 | -13.583 | -2.663 | -0.058 |
| -3.382999999999939 | -13.532 | -2.645 | -0.056 |
| -3.379999999999939 | -13.481 | -2.628 | -0.055 |
| -3.376999999999938 | -13.43 | -2.611 | -0.054 |
| -3.373999999999938 | -13.38 | -2.594 | -0.052 |
| -3.370999999999938 | -13.329 | -2.577 | -0.051 |
| -3.367999999999938 | -13.278 | -2.56 | -0.05 |
| -3.364999999999938 | -13.228 | -2.543 | -0.049 |
| -3.361999999999938 | -13.178 | -2.527 | -0.047 |
| -3.358999999999938 | -13.128 | -2.51 | -0.046 |
| -3.355999999999938 | -13.078 | -2.493 | -0.045 |
| -3.352999999999938 | -13.028 | -2.477 | -0.044 |
| -3.349999999999937 | -12.978 | -2.46 | -0.043 |
| -3.346999999999937 | -12.928 | -2.444 | -0.042 |
| -3.343999999999937 | -12.879 | -2.428 | -0.041 |
| -3.340999999999937 | -12.829 | -2.411 | -0.04 |
| -3.337999999999937 | -12.78 | -2.395 | -0.039 |
| -3.334999999999937 | -12.731 | -2.379 | -0.038 |
| -3.331999999999937 | -12.682 | -2.363 | -0.037 |
| -3.328999999999937 | -12.633 | -2.347 | -0.036 |
| -3.325999999999937 | -12.584 | -2.331 | -0.035 |
| -3.322999999999936 | -12.536 | -2.316 | -0.034 |
| -3.319999999999936 | -12.487 | -2.3 | -0.033 |
| -3.316999999999936 | -12.439 | -2.284 | -0.032 |
| -3.313999999999936 | -12.391 | -2.269 | -0.031 |
| -3.310999999999936 | -12.342 | -2.253 | -0.03 |
| -3.307999999999936 | -12.294 | -2.238 | -0.029 |
| -3.304999999999936 | -12.247 | -2.222 | -0.028 |
| -3.301999999999936 | -12.199 | -2.207 | -0.028 |
| -3.298999999999936 | -12.151 | -2.192 | -0.027 |
| -3.295999999999935 | -12.104 | -2.177 | -0.026 |
| -3.292999999999935 | -12.056 | -2.162 | -0.025 |
| -3.289999999999935 | -12.009 | -2.147 | -0.024 |
| -3.286999999999935 | -11.962 | -2.132 | -0.024 |
| -3.283999999999935 | -11.915 | -2.117 | -0.023 |
| -3.280999999999935 | -11.868 | -2.102 | -0.022 |
| -3.277999999999935 | -11.821 | -2.087 | -0.021 |
| -3.274999999999935 | -11.775 | -2.073 | -0.021 |
| -3.271999999999934 | -11.728 | -2.058 | -0.02 |
| -3.268999999999934 | -11.682 | -2.044 | -0.019 |
| -3.265999999999934 | -11.635 | -2.029 | -0.019 |
| -3.262999999999934 | -11.589 | -2.015 | -0.018 |
| -3.259999999999934 | -11.543 | -2 | -0.018 |
| -3.256999999999934 | -11.497 | -1.986 | -0.017 |
| -3.253999999999934 | -11.451 | -1.972 | -0.016 |
| -3.250999999999934 | -11.406 | -1.958 | -0.016 |
| -3.247999999999933 | -11.36 | -1.944 | -0.015 |
| -3.244999999999933 | -11.315 | -1.93 | -0.015 |
| -3.241999999999933 | -11.27 | -1.916 | -0.014 |
| -3.238999999999933 | -11.224 | -1.902 | -0.014 |
| -3.235999999999933 | -11.179 | -1.888 | -0.013 |
| -3.232999999999933 | -11.134 | -1.875 | -0.013 |
| -3.229999999999933 | -11.09 | -1.861 | -0.012 |
| -3.226999999999933 | -11.045 | -1.847 | -0.012 |
| -3.223999999999932 | -11 | -1.834 | -0.011 |
| -3.220999999999932 | -10.956 | -1.82 | -0.011 |
| -3.217999999999932 | -10.912 | -1.807 | -0.01 |
| -3.214999999999932 | -10.867 | -1.794 | -0.01 |
| -3.211999999999932 | -10.823 | -1.78 | -0.01 |
| -3.208999999999932 | -10.779 | -1.767 | -0.009 |
| -3.205999999999932 | -10.735 | -1.754 | -0.009 |
| -3.202999999999932 | -10.692 | -1.741 | -0.008 |
| -3.199999999999932 | -10.648 | -1.728 | -0.008 |
| -3.196999999999932 | -10.604 | -1.715 | -0.008 |
| -3.193999999999932 | -10.561 | -1.702 | -0.007 |
| -3.190999999999931 | -10.518 | -1.689 | -0.007 |
| -3.187999999999931 | -10.475 | -1.677 | -0.007 |
| -3.184999999999931 | -10.432 | -1.664 | -0.006 |
| -3.181999999999931 | -10.389 | -1.651 | -0.006 |
| -3.178999999999931 | -10.346 | -1.639 | -0.006 |
| -3.175999999999931 | -10.303 | -1.626 | -0.005 |
| -3.172999999999931 | -10.261 | -1.614 | -0.005 |
| -3.169999999999931 | -10.218 | -1.602 | -0.005 |
| -3.166999999999931 | -10.176 | -1.589 | -0.005 |
| -3.16399999999993 | -10.134 | -1.577 | -0.004 |
| -3.16099999999993 | -10.092 | -1.565 | -0.004 |
| -3.15799999999993 | -10.05 | -1.553 | -0.004 |
| -3.15499999999993 | -10.008 | -1.541 | -0.004 |
| -3.15199999999993 | -9.966 | -1.529 | -0.004 |
| -3.14899999999993 | -9.925 | -1.517 | -0.003 |
| -3.14599999999993 | -9.883 | -1.505 | -0.003 |
| -3.14299999999993 | -9.842 | -1.493 | -0.003 |
| -3.139999999999929 | -9.8 | -1.482 | -0.003 |
| -3.136999999999929 | -9.759 | -1.47 | -0.003 |
| -3.133999999999929 | -9.718 | -1.458 | -0.002 |
| -3.130999999999929 | -9.677 | -1.447 | -0.002 |
| -3.12799999999993 | -9.636 | -1.435 | -0.002 |
| -3.124999999999929 | -9.596 | -1.424 | -0.002 |
| -3.121999999999929 | -9.555 | -1.412 | -0.002 |
| -3.118999999999929 | -9.515 | -1.401 | -0.002 |
| -3.115999999999929 | -9.474 | -1.39 | -0.002 |
| -3.112999999999928 | -9.434 | -1.379 | -0.001 |
| -3.109999999999928 | -9.394 | -1.368 | -0.001 |
| -3.106999999999928 | -9.354 | -1.357 | -0.001 |
| -3.103999999999928 | -9.314 | -1.346 | -0.001 |
| -3.100999999999928 | -9.274 | -1.335 | -0.001 |
| -3.097999999999928 | -9.235 | -1.324 | -0.001 |
| -3.094999999999928 | -9.195 | -1.313 | -0.001 |
| -3.091999999999928 | -9.156 | -1.302 | -0.001 |
| -3.088999999999928 | -9.116 | -1.291 | -0.001 |
| -3.085999999999927 | -9.077 | -1.281 | -0.001 |
| -3.082999999999927 | -9.038 | -1.27 | -0.001 |
| -3.079999999999927 | -8.999 | -1.26 | -0.001 |
| -3.076999999999927 | -8.96 | -1.249 | 0 |
| -3.073999999999927 | -8.921 | -1.239 | 0 |
| -3.070999999999927 | -8.883 | -1.228 | 0 |
| -3.067999999999927 | -8.844 | -1.218 | 0 |
| -3.064999999999927 | -8.806 | -1.208 | 0 |
| -3.061999999999927 | -8.767 | -1.198 | 0 |
| -3.058999999999926 | -8.729 | -1.188 | 0 |
| -3.055999999999926 | -8.691 | -1.178 | 0 |
| -3.052999999999926 | -8.653 | -1.168 | 0 |
| -3.049999999999926 | -8.615 | -1.158 | 0 |
| -3.046999999999926 | -8.577 | -1.148 | 0 |
| -3.043999999999926 | -8.54 | -1.138 | 0 |
| -3.040999999999926 | -8.502 | -1.128 | 0 |
| -3.037999999999926 | -8.465 | -1.118 | 0 |
| -3.034999999999926 | -8.427 | -1.109 | 0 |
| -3.031999999999925 | -8.39 | -1.099 | 0 |
| -3.028999999999925 | -8.353 | -1.09 | 0 |
| -3.025999999999925 | -8.316 | -1.08 | 0 |
| -3.022999999999925 | -8.279 | -1.071 | 0 |
| -3.019999999999925 | -8.242 | -1.061 | 0 |
| -3.016999999999925 | -8.206 | -1.052 | 0 |
| -3.013999999999925 | -8.169 | -1.043 | 0 |
| -3.010999999999925 | -8.133 | -1.033 | 0 |
| -3.007999999999925 | -8.096 | -1.024 | 0 |
| -3.004999999999924 | -8.06 | -1.015 | 0 |
| -3.001999999999924 | -8.024 | -1.006 | 0 |
| -2.998999999999924 | -7.988 | -0.997 | 0 |
| -2.995999999999924 | -7.952 | -0.988 | 0 |
| -2.992999999999924 | -7.916 | -0.979 | 0 |
| -2.989999999999924 | -7.881 | -0.97 | 0 |
| -2.986999999999924 | -7.845 | -0.962 | 0 |
| -2.983999999999924 | -7.81 | -0.953 | 0 |
| -2.980999999999923 | -7.774 | -0.944 | 0 |
| -2.977999999999923 | -7.739 | -0.935 | 0 |
| -2.974999999999923 | -7.704 | -0.927 | 0 |
| -2.971999999999923 | -7.669 | -0.918 | 0 |
| -2.968999999999923 | -7.634 | -0.91 | 0 |
| -2.965999999999923 | -7.599 | -0.901 | 0 |
| -2.962999999999923 | -7.564 | -0.893 | 0 |
| -2.959999999999923 | -7.53 | -0.885 | 0 |
| -2.956999999999923 | -7.495 | -0.876 | 0 |
| -2.953999999999922 | -7.461 | -0.868 | 0 |
| -2.950999999999922 | -7.426 | -0.86 | 0 |
| -2.947999999999922 | -7.392 | -0.852 | 0 |
| -2.944999999999922 | -7.358 | -0.844 | 0 |
| -2.941999999999922 | -7.324 | -0.836 | 0 |
| -2.938999999999922 | -7.29 | -0.828 | 0 |
| -2.935999999999922 | -7.256 | -0.82 | 0 |
| -2.932999999999922 | -7.223 | -0.812 | 0 |
| -2.929999999999922 | -7.189 | -0.804 | 0 |
| -2.926999999999921 | -7.156 | -0.797 | 0 |
| -2.923999999999921 | -7.122 | -0.789 | 0 |
| -2.920999999999921 | -7.089 | -0.781 | 0 |
| -2.917999999999921 | -7.056 | -0.774 | 0.001 |
| -2.914999999999921 | -7.023 | -0.766 | 0.001 |
| -2.911999999999921 | -6.99 | -0.759 | 0.001 |
| -2.908999999999921 | -6.957 | -0.751 | 0.001 |
| -2.905999999999921 | -6.924 | -0.744 | 0.001 |
| -2.902999999999921 | -6.892 | -0.736 | 0.001 |
| -2.89999999999992 | -6.859 | -0.729 | 0.001 |
| -2.89699999999992 | -6.827 | -0.722 | 0.001 |
| -2.89399999999992 | -6.794 | -0.715 | 0.001 |
| -2.89099999999992 | -6.762 | -0.707 | 0.001 |
| -2.88799999999992 | -6.73 | -0.7 | 0.001 |
| -2.88499999999992 | -6.698 | -0.693 | 0.002 |
| -2.88199999999992 | -6.666 | -0.686 | 0.002 |
| -2.87899999999992 | -6.634 | -0.679 | 0.002 |
| -2.875999999999919 | -6.602 | -0.672 | 0.002 |
| -2.872999999999919 | -6.571 | -0.665 | 0.002 |
| -2.869999999999919 | -6.539 | -0.659 | 0.002 |
| -2.866999999999919 | -6.508 | -0.652 | 0.002 |
| -2.863999999999919 | -6.476 | -0.645 | 0.003 |
| -2.860999999999919 | -6.445 | -0.638 | 0.003 |
| -2.857999999999919 | -6.414 | -0.632 | 0.003 |
| -2.854999999999919 | -6.383 | -0.625 | 0.003 |
| -2.851999999999919 | -6.352 | -0.618 | 0.003 |
| -2.848999999999918 | -6.321 | -0.612 | 0.003 |
| -2.845999999999918 | -6.291 | -0.605 | 0.004 |
| -2.842999999999918 | -6.26 | -0.599 | 0.004 |
| -2.839999999999918 | -6.23 | -0.593 | 0.004 |
| -2.836999999999918 | -6.199 | -0.586 | 0.004 |
| -2.833999999999918 | -6.169 | -0.58 | 0.005 |
| -2.830999999999918 | -6.139 | -0.574 | 0.005 |
| -2.827999999999918 | -6.108 | -0.568 | 0.005 |
| -2.824999999999918 | -6.078 | -0.562 | 0.005 |
| -2.821999999999917 | -6.048 | -0.555 | 0.006 |
| -2.818999999999917 | -6.019 | -0.549 | 0.006 |
| -2.815999999999917 | -5.989 | -0.543 | 0.006 |
| -2.812999999999917 | -5.959 | -0.537 | 0.007 |
| -2.809999999999917 | -5.93 | -0.531 | 0.007 |
| -2.806999999999917 | -5.9 | -0.526 | 0.007 |
| -2.803999999999917 | -5.871 | -0.52 | 0.008 |
| -2.800999999999917 | -5.842 | -0.514 | 0.008 |
| -2.797999999999916 | -5.813 | -0.508 | 0.008 |
| -2.794999999999916 | -5.784 | -0.502 | 0.009 |
| -2.791999999999916 | -5.755 | -0.497 | 0.009 |
| -2.788999999999916 | -5.726 | -0.491 | 0.009 |
| -2.785999999999916 | -5.697 | -0.486 | 0.01 |
| -2.782999999999916 | -5.668 | -0.48 | 0.01 |
| -2.779999999999916 | -5.64 | -0.475 | 0.011 |
| -2.776999999999916 | -5.611 | -0.469 | 0.011 |
| -2.773999999999916 | -5.583 | -0.464 | 0.012 |
| -2.770999999999915 | -5.555 | -0.458 | 0.012 |
| -2.767999999999915 | -5.526 | -0.453 | 0.012 |
| -2.764999999999915 | -5.498 | -0.448 | 0.013 |
| -2.761999999999915 | -5.47 | -0.442 | 0.013 |
| -2.758999999999915 | -5.442 | -0.437 | 0.014 |
| -2.755999999999915 | -5.415 | -0.432 | 0.015 |
| -2.752999999999915 | -5.387 | -0.427 | 0.015 |
| -2.749999999999915 | -5.359 | -0.422 | 0.016 |
| -2.746999999999915 | -5.332 | -0.417 | 0.016 |
| -2.743999999999914 | -5.304 | -0.412 | 0.017 |
| -2.740999999999914 | -5.277 | -0.407 | 0.017 |
| -2.737999999999914 | -5.25 | -0.402 | 0.018 |
| -2.734999999999914 | -5.223 | -0.397 | 0.019 |
| -2.731999999999914 | -5.196 | -0.392 | 0.019 |
| -2.728999999999914 | -5.169 | -0.387 | 0.02 |
| -2.725999999999914 | -5.142 | -0.383 | 0.021 |
| -2.722999999999914 | -5.115 | -0.378 | 0.021 |
| -2.719999999999914 | -5.088 | -0.373 | 0.022 |
| -2.716999999999913 | -5.062 | -0.369 | 0.023 |
| -2.713999999999913 | -5.035 | -0.364 | 0.023 |
| -2.710999999999913 | -5.009 | -0.359 | 0.024 |
| -2.707999999999913 | -4.983 | -0.355 | 0.025 |
| -2.704999999999913 | -4.956 | -0.35 | 0.026 |
| -2.701999999999913 | -4.93 | -0.346 | 0.026 |
| -2.698999999999913 | -4.904 | -0.342 | 0.027 |
| -2.695999999999913 | -4.878 | -0.337 | 0.028 |
| -2.692999999999912 | -4.853 | -0.333 | 0.029 |
| -2.689999999999912 | -4.827 | -0.329 | 0.03 |
| -2.686999999999912 | -4.801 | -0.324 | 0.031 |
| -2.683999999999912 | -4.776 | -0.32 | 0.032 |
| -2.680999999999912 | -4.75 | -0.316 | 0.032 |
| -2.677999999999912 | -4.725 | -0.312 | 0.033 |
| -2.674999999999912 | -4.699 | -0.308 | 0.034 |
| -2.671999999999912 | -4.674 | -0.303 | 0.035 |
| -2.668999999999912 | -4.649 | -0.299 | 0.036 |
| -2.665999999999911 | -4.624 | -0.295 | 0.037 |
| -2.662999999999911 | -4.599 | -0.291 | 0.038 |
| -2.659999999999911 | -4.574 | -0.287 | 0.039 |
| -2.656999999999911 | -4.55 | -0.284 | 0.04 |
| -2.653999999999911 | -4.525 | -0.28 | 0.041 |
| -2.650999999999911 | -4.5 | -0.276 | 0.043 |
| -2.647999999999911 | -4.476 | -0.272 | 0.044 |
| -2.644999999999911 | -4.451 | -0.268 | 0.045 |
| -2.641999999999911 | -4.427 | -0.265 | 0.046 |
| -2.63899999999991 | -4.403 | -0.261 | 0.047 |
| -2.63599999999991 | -4.379 | -0.257 | 0.048 |
| -2.63299999999991 | -4.355 | -0.254 | 0.049 |
| -2.62999999999991 | -4.331 | -0.25 | 0.051 |
| -2.62699999999991 | -4.307 | -0.246 | 0.052 |
| -2.62399999999991 | -4.283 | -0.243 | 0.053 |
| -2.62099999999991 | -4.259 | -0.239 | 0.054 |
| -2.61799999999991 | -4.236 | -0.236 | 0.056 |
| -2.61499999999991 | -4.212 | -0.233 | 0.057 |
| -2.611999999999909 | -4.189 | -0.229 | 0.058 |
| -2.608999999999909 | -4.166 | -0.226 | 0.06 |
| -2.605999999999909 | -4.142 | -0.223 | 0.061 |
| -2.602999999999909 | -4.119 | -0.219 | 0.063 |
| -2.599999999999909 | -4.096 | -0.216 | 0.064 |
| -2.596999999999909 | -4.073 | -0.213 | 0.065 |
| -2.593999999999909 | -4.05 | -0.21 | 0.067 |
| -2.590999999999909 | -4.027 | -0.206 | 0.068 |
| -2.587999999999909 | -4.005 | -0.203 | 0.07 |
| -2.584999999999908 | -3.982 | -0.2 | 0.071 |
| -2.581999999999908 | -3.959 | -0.197 | 0.073 |
| -2.578999999999908 | -3.937 | -0.194 | 0.075 |
| -2.575999999999908 | -3.914 | -0.191 | 0.076 |
| -2.572999999999908 | -3.892 | -0.188 | 0.078 |
| -2.569999999999908 | -3.87 | -0.185 | 0.08 |
| -2.566999999999908 | -3.848 | -0.182 | 0.081 |
| -2.563999999999908 | -3.826 | -0.179 | 0.083 |
| -2.560999999999908 | -3.804 | -0.177 | 0.085 |
| -2.557999999999907 | -3.782 | -0.174 | 0.086 |
| -2.554999999999907 | -3.76 | -0.171 | 0.088 |
| -2.551999999999907 | -3.738 | -0.168 | 0.09 |
| -2.548999999999907 | -3.717 | -0.165 | 0.092 |
| -2.545999999999907 | -3.695 | -0.163 | 0.094 |
| -2.542999999999907 | -3.674 | -0.16 | 0.095 |
| -2.539999999999907 | -3.652 | -0.157 | 0.097 |
| -2.536999999999907 | -3.631 | -0.155 | 0.099 |
| -2.533999999999907 | -3.61 | -0.152 | 0.101 |
| -2.530999999999906 | -3.589 | -0.15 | 0.103 |
| -2.527999999999906 | -3.568 | -0.147 | 0.105 |
| -2.524999999999906 | -3.547 | -0.145 | 0.107 |
| -2.521999999999906 | -3.526 | -0.142 | 0.109 |
| -2.518999999999906 | -3.505 | -0.14 | 0.111 |
| -2.515999999999906 | -3.484 | -0.137 | 0.113 |
| -2.512999999999906 | -3.464 | -0.135 | 0.116 |
| -2.509999999999906 | -3.443 | -0.133 | 0.118 |
| -2.506999999999906 | -3.422 | -0.13 | 0.12 |
| -2.503999999999905 | -3.402 | -0.128 | 0.122 |
| -2.500999999999905 | -3.382 | -0.126 | 0.124 |
| -2.497999999999905 | -3.362 | -0.124 | 0.127 |
| -2.494999999999905 | -3.341 | -0.121 | 0.129 |
| -2.491999999999905 | -3.321 | -0.119 | 0.131 |
| -2.488999999999905 | -3.301 | -0.117 | 0.133 |
| -2.485999999999905 | -3.281 | -0.115 | 0.136 |
| -2.482999999999905 | -3.262 | -0.113 | 0.138 |
| -2.479999999999904 | -3.242 | -0.111 | 0.141 |
| -2.476999999999904 | -3.222 | -0.109 | 0.143 |
| -2.473999999999904 | -3.203 | -0.106 | 0.146 |
| -2.470999999999904 | -3.183 | -0.104 | 0.148 |
| -2.467999999999904 | -3.164 | -0.103 | 0.151 |
| -2.464999999999904 | -3.144 | -0.101 | 0.153 |
| -2.461999999999904 | -3.125 | -0.099 | 0.156 |
| -2.458999999999904 | -3.106 | -0.097 | 0.158 |
| -2.455999999999904 | -3.087 | -0.095 | 0.161 |
| -2.452999999999903 | -3.068 | -0.093 | 0.164 |
| -2.449999999999903 | -3.049 | -0.091 | 0.166 |
| -2.446999999999903 | -3.03 | -0.089 | 0.169 |
| -2.443999999999903 | -3.011 | -0.088 | 0.172 |
| -2.440999999999903 | -2.992 | -0.086 | 0.175 |
| -2.437999999999903 | -2.974 | -0.084 | 0.178 |
| -2.434999999999903 | -2.955 | -0.082 | 0.18 |
| -2.431999999999903 | -2.936 | -0.081 | 0.183 |
| -2.428999999999903 | -2.918 | -0.079 | 0.186 |
| -2.425999999999902 | -2.9 | -0.077 | 0.189 |
| -2.422999999999902 | -2.881 | -0.076 | 0.192 |
| -2.419999999999902 | -2.863 | -0.074 | 0.195 |
| -2.416999999999902 | -2.845 | -0.073 | 0.198 |
| -2.413999999999902 | -2.827 | -0.071 | 0.201 |
| -2.410999999999902 | -2.809 | -0.069 | 0.204 |
| -2.407999999999902 | -2.791 | -0.068 | 0.207 |
| -2.404999999999902 | -2.774 | -0.066 | 0.211 |
| -2.401999999999902 | -2.756 | -0.065 | 0.214 |
| -2.398999999999901 | -2.738 | -0.064 | 0.217 |
| -2.395999999999901 | -2.721 | -0.062 | 0.22 |
| -2.392999999999901 | -2.703 | -0.061 | 0.224 |
| -2.389999999999901 | -2.686 | -0.059 | 0.227 |
| -2.386999999999901 | -2.668 | -0.058 | 0.23 |
| -2.383999999999901 | -2.651 | -0.057 | 0.234 |
| -2.380999999999901 | -2.634 | -0.055 | 0.237 |
| -2.377999999999901 | -2.617 | -0.054 | 0.241 |
| -2.3749999999999 | -2.6 | -0.053 | 0.244 |
| -2.3719999999999 | -2.583 | -0.051 | 0.248 |
| -2.3689999999999 | -2.566 | -0.05 | 0.251 |
| -2.3659999999999 | -2.549 | -0.049 | 0.255 |
| -2.3629999999999 | -2.532 | -0.048 | 0.258 |
| -2.3599999999999 | -2.515 | -0.047 | 0.262 |
| -2.3569999999999 | -2.499 | -0.045 | 0.266 |
| -2.3539999999999 | -2.482 | -0.044 | 0.27 |
| -2.3509999999999 | -2.466 | -0.043 | 0.273 |
| -2.347999999999899 | -2.449 | -0.042 | 0.277 |
| -2.344999999999899 | -2.433 | -0.041 | 0.281 |
| -2.341999999999899 | -2.417 | -0.04 | 0.285 |
| -2.338999999999899 | -2.401 | -0.039 | 0.289 |
| -2.335999999999899 | -2.385 | -0.038 | 0.293 |
| -2.332999999999899 | -2.369 | -0.037 | 0.297 |
| -2.329999999999899 | -2.353 | -0.036 | 0.301 |
| -2.326999999999899 | -2.337 | -0.035 | 0.305 |
| -2.323999999999899 | -2.321 | -0.034 | 0.309 |
| -2.320999999999898 | -2.305 | -0.033 | 0.313 |
| -2.317999999999898 | -2.29 | -0.032 | 0.317 |
| -2.314999999999898 | -2.274 | -0.031 | 0.321 |
| -2.311999999999898 | -2.258 | -0.03 | 0.326 |
| -2.308999999999898 | -2.243 | -0.03 | 0.33 |
| -2.305999999999898 | -2.228 | -0.029 | 0.334 |
| -2.302999999999898 | -2.212 | -0.028 | 0.339 |
| -2.299999999999898 | -2.197 | -0.027 | 0.343 |
| -2.296999999999898 | -2.182 | -0.026 | 0.347 |
| -2.293999999999897 | -2.167 | -0.025 | 0.352 |
| -2.290999999999897 | -2.152 | -0.025 | 0.356 |
| -2.287999999999897 | -2.137 | -0.024 | 0.361 |
| -2.284999999999897 | -2.122 | -0.023 | 0.366 |
| -2.281999999999897 | -2.107 | -0.022 | 0.37 |
| -2.278999999999897 | -2.092 | -0.022 | 0.375 |
| -2.275999999999897 | -2.078 | -0.021 | 0.38 |
| -2.272999999999897 | -2.063 | -0.02 | 0.384 |
| -2.269999999999897 | -2.048 | -0.02 | 0.389 |
| -2.266999999999896 | -2.034 | -0.019 | 0.394 |
| -2.263999999999896 | -2.019 | -0.018 | 0.399 |
| -2.260999999999896 | -2.005 | -0.018 | 0.404 |
| -2.257999999999896 | -1.991 | -0.017 | 0.409 |
| -2.254999999999896 | -1.977 | -0.017 | 0.413 |
| -2.251999999999896 | -1.963 | -0.016 | 0.419 |
| -2.248999999999896 | -1.948 | -0.015 | 0.424 |
| -2.245999999999896 | -1.934 | -0.015 | 0.429 |
| -2.242999999999896 | -1.92 | -0.014 | 0.434 |
| -2.239999999999895 | -1.907 | -0.014 | 0.439 |
| -2.236999999999895 | -1.893 | -0.013 | 0.444 |
| -2.233999999999895 | -1.879 | -0.013 | 0.449 |
| -2.230999999999895 | -1.865 | -0.012 | 0.455 |
| -2.227999999999895 | -1.852 | -0.012 | 0.46 |
| -2.224999999999895 | -1.838 | -0.011 | 0.465 |
| -2.221999999999895 | -1.825 | -0.011 | 0.471 |
| -2.218999999999895 | -1.811 | -0.011 | 0.476 |
| -2.215999999999894 | -1.798 | -0.01 | 0.482 |
| -2.212999999999894 | -1.785 | -0.01 | 0.487 |
| -2.209999999999894 | -1.772 | -0.009 | 0.493 |
| -2.206999999999894 | -1.758 | -0.009 | 0.499 |
| -2.203999999999894 | -1.745 | -0.008 | 0.504 |
| -2.200999999999894 | -1.732 | -0.008 | 0.51 |
| -2.197999999999894 | -1.719 | -0.008 | 0.516 |
| -2.194999999999894 | -1.706 | -0.007 | 0.522 |
| -2.191999999999894 | -1.694 | -0.007 | 0.528 |
| -2.188999999999893 | -1.681 | -0.007 | 0.533 |
| -2.185999999999893 | -1.668 | -0.006 | 0.539 |
| -2.182999999999893 | -1.656 | -0.006 | 0.545 |
| -2.179999999999893 | -1.643 | -0.006 | 0.551 |
| -2.176999999999893 | -1.631 | -0.006 | 0.557 |
| -2.173999999999893 | -1.618 | -0.005 | 0.564 |
| -2.170999999999893 | -1.606 | -0.005 | 0.57 |
| -2.167999999999893 | -1.593 | -0.005 | 0.576 |
| -2.164999999999893 | -1.581 | -0.004 | 0.582 |
| -2.161999999999892 | -1.569 | -0.004 | 0.588 |
| -2.158999999999892 | -1.557 | -0.004 | 0.595 |
| -2.155999999999892 | -1.545 | -0.004 | 0.601 |
| -2.152999999999892 | -1.533 | -0.004 | 0.608 |
| -2.149999999999892 | -1.521 | -0.003 | 0.614 |
| -2.146999999999892 | -1.509 | -0.003 | 0.621 |
| -2.143999999999892 | -1.497 | -0.003 | 0.627 |
| -2.140999999999892 | -1.485 | -0.003 | 0.634 |
| -2.137999999999892 | -1.474 | -0.003 | 0.641 |
| -2.134999999999891 | -1.462 | -0.002 | 0.647 |
| -2.131999999999891 | -1.451 | -0.002 | 0.654 |
| -2.128999999999891 | -1.439 | -0.002 | 0.661 |
| -2.125999999999891 | -1.428 | -0.002 | 0.668 |
| -2.122999999999891 | -1.416 | -0.002 | 0.675 |
| -2.119999999999891 | -1.405 | -0.002 | 0.681 |
| -2.116999999999891 | -1.394 | -0.002 | 0.688 |
| -2.113999999999891 | -1.382 | -0.001 | 0.696 |
| -2.110999999999891 | -1.371 | -0.001 | 0.703 |
| -2.10799999999989 | -1.36 | -0.001 | 0.71 |
| -2.10499999999989 | -1.349 | -0.001 | 0.717 |
| -2.10199999999989 | -1.338 | -0.001 | 0.724 |
| -2.09899999999989 | -1.327 | -0.001 | 0.731 |
| -2.09599999999989 | -1.317 | -0.001 | 0.739 |
| -2.09299999999989 | -1.306 | -0.001 | 0.746 |
| -2.08999999999989 | -1.295 | -0.001 | 0.754 |
| -2.08699999999989 | -1.284 | -0.001 | 0.761 |
| -2.083999999999889 | -1.274 | -0.001 | 0.769 |
| -2.080999999999889 | -1.263 | -0.001 | 0.776 |
| -2.077999999999889 | -1.253 | 0 | 0.784 |
| -2.074999999999889 | -1.242 | 0 | 0.791 |
| -2.071999999999889 | -1.232 | 0 | 0.799 |
| -2.068999999999889 | -1.222 | 0 | 0.807 |
| -2.065999999999889 | -1.211 | 0 | 0.815 |
| -2.062999999999889 | -1.201 | 0 | 0.823 |
| -2.059999999999889 | -1.191 | 0 | 0.831 |
| -2.056999999999888 | -1.181 | 0 | 0.839 |
| -2.053999999999888 | -1.171 | 0 | 0.847 |
| -2.050999999999888 | -1.161 | 0 | 0.855 |
| -2.047999999999888 | -1.151 | 0 | 0.863 |
| -2.044999999999888 | -1.141 | 0 | 0.871 |
| -2.041999999999888 | -1.131 | 0 | 0.879 |
| -2.038999999999888 | -1.122 | 0 | 0.888 |
| -2.035999999999888 | -1.112 | 0 | 0.896 |
| -2.032999999999888 | -1.102 | 0 | 0.904 |
| -2.029999999999887 | -1.093 | 0 | 0.913 |
| -2.026999999999887 | -1.083 | 0 | 0.921 |
| -2.023999999999887 | -1.074 | 0 | 0.93 |
| -2.020999999999887 | -1.064 | 0 | 0.938 |
| -2.017999999999887 | -1.055 | 0 | 0.947 |
| -2.014999999999887 | -1.046 | 0 | 0.956 |
| -2.011999999999887 | -1.036 | 0 | 0.964 |
| -2.008999999999887 | -1.027 | 0 | 0.973 |
| -2.005999999999887 | -1.018 | 0 | 0.982 |
| -2.002999999999886 | -1.009 | 0 | 0.991 |
| -1.999999999999886 | -1 | 0 | 1 |
| -1.996999999999887 | -0.991 | 0 | 1.009 |
| -1.993999999999887 | -0.982 | 0 | 1.018 |
| -1.990999999999887 | -0.973 | 0 | 1.027 |
| -1.987999999999887 | -0.964 | 0 | 1.036 |
| -1.984999999999887 | -0.956 | 0 | 1.046 |
| -1.981999999999887 | -0.947 | 0 | 1.055 |
| -1.978999999999887 | -0.938 | 0 | 1.064 |
| -1.975999999999887 | -0.93 | 0 | 1.074 |
| -1.972999999999887 | -0.921 | 0 | 1.083 |
| -1.969999999999888 | -0.913 | 0 | 1.093 |
| -1.966999999999888 | -0.904 | 0 | 1.102 |
| -1.963999999999888 | -0.896 | 0 | 1.112 |
| -1.960999999999888 | -0.888 | 0 | 1.122 |
| -1.957999999999888 | -0.879 | 0 | 1.131 |
| -1.954999999999888 | -0.871 | 0 | 1.141 |
| -1.951999999999888 | -0.863 | 0 | 1.151 |
| -1.948999999999888 | -0.855 | 0 | 1.161 |
| -1.945999999999888 | -0.847 | 0 | 1.171 |
| -1.942999999999889 | -0.839 | 0 | 1.181 |
| -1.939999999999889 | -0.831 | 0 | 1.191 |
| -1.936999999999889 | -0.823 | 0 | 1.201 |
| -1.933999999999889 | -0.815 | 0 | 1.211 |
| -1.930999999999889 | -0.807 | 0 | 1.222 |
| -1.927999999999889 | -0.799 | 0 | 1.232 |
| -1.924999999999889 | -0.791 | 0 | 1.242 |
| -1.921999999999889 | -0.784 | 0 | 1.253 |
| -1.918999999999889 | -0.776 | 0.001 | 1.263 |
| -1.91599999999989 | -0.769 | 0.001 | 1.274 |
| -1.91299999999989 | -0.761 | 0.001 | 1.284 |
| -1.90999999999989 | -0.754 | 0.001 | 1.295 |
| -1.90699999999989 | -0.746 | 0.001 | 1.306 |
| -1.90399999999989 | -0.739 | 0.001 | 1.317 |
| -1.90099999999989 | -0.731 | 0.001 | 1.327 |
| -1.89799999999989 | -0.724 | 0.001 | 1.338 |
| -1.89499999999989 | -0.717 | 0.001 | 1.349 |
| -1.89199999999989 | -0.71 | 0.001 | 1.36 |
| -1.88899999999989 | -0.703 | 0.001 | 1.371 |
| -1.885999999999891 | -0.696 | 0.001 | 1.382 |
| -1.882999999999891 | -0.688 | 0.002 | 1.394 |
| -1.879999999999891 | -0.681 | 0.002 | 1.405 |
| -1.876999999999891 | -0.675 | 0.002 | 1.416 |
| -1.873999999999891 | -0.668 | 0.002 | 1.428 |
| -1.870999999999891 | -0.661 | 0.002 | 1.439 |
| -1.867999999999891 | -0.654 | 0.002 | 1.451 |
| -1.864999999999891 | -0.647 | 0.002 | 1.462 |
| -1.861999999999891 | -0.641 | 0.003 | 1.474 |
| -1.858999999999892 | -0.634 | 0.003 | 1.485 |
| -1.855999999999892 | -0.627 | 0.003 | 1.497 |
| -1.852999999999892 | -0.621 | 0.003 | 1.509 |
| -1.849999999999892 | -0.614 | 0.003 | 1.521 |
| -1.846999999999892 | -0.608 | 0.004 | 1.533 |
| -1.843999999999892 | -0.601 | 0.004 | 1.545 |
| -1.840999999999892 | -0.595 | 0.004 | 1.557 |
| -1.837999999999892 | -0.588 | 0.004 | 1.569 |
| -1.834999999999892 | -0.582 | 0.004 | 1.581 |
| -1.831999999999893 | -0.576 | 0.005 | 1.593 |
| -1.828999999999893 | -0.57 | 0.005 | 1.606 |
| -1.825999999999893 | -0.564 | 0.005 | 1.618 |
| -1.822999999999893 | -0.557 | 0.006 | 1.631 |
| -1.819999999999893 | -0.551 | 0.006 | 1.643 |
| -1.816999999999893 | -0.545 | 0.006 | 1.656 |
| -1.813999999999893 | -0.539 | 0.006 | 1.668 |
| -1.810999999999893 | -0.533 | 0.007 | 1.681 |
| -1.807999999999893 | -0.528 | 0.007 | 1.694 |
| -1.804999999999894 | -0.522 | 0.007 | 1.706 |
| -1.801999999999894 | -0.516 | 0.008 | 1.719 |
| -1.798999999999894 | -0.51 | 0.008 | 1.732 |
| -1.795999999999894 | -0.504 | 0.008 | 1.745 |
| -1.792999999999894 | -0.499 | 0.009 | 1.758 |
| -1.789999999999894 | -0.493 | 0.009 | 1.772 |
| -1.786999999999894 | -0.487 | 0.01 | 1.785 |
| -1.783999999999894 | -0.482 | 0.01 | 1.798 |
| -1.780999999999894 | -0.476 | 0.011 | 1.811 |
| -1.777999999999894 | -0.471 | 0.011 | 1.825 |
| -1.774999999999895 | -0.465 | 0.011 | 1.838 |
| -1.771999999999895 | -0.46 | 0.012 | 1.852 |
| -1.768999999999895 | -0.455 | 0.012 | 1.865 |
| -1.765999999999895 | -0.449 | 0.013 | 1.879 |
| -1.762999999999895 | -0.444 | 0.013 | 1.893 |
| -1.759999999999895 | -0.439 | 0.014 | 1.907 |
| -1.756999999999895 | -0.434 | 0.014 | 1.92 |
| -1.753999999999895 | -0.429 | 0.015 | 1.934 |
| -1.750999999999895 | -0.424 | 0.015 | 1.948 |
| -1.747999999999896 | -0.419 | 0.016 | 1.963 |
| -1.744999999999896 | -0.413 | 0.017 | 1.977 |
| -1.741999999999896 | -0.409 | 0.017 | 1.991 |
| -1.738999999999896 | -0.404 | 0.018 | 2.005 |
| -1.735999999999896 | -0.399 | 0.018 | 2.019 |
| -1.732999999999896 | -0.394 | 0.019 | 2.034 |
| -1.729999999999896 | -0.389 | 0.02 | 2.048 |
| -1.726999999999896 | -0.384 | 0.02 | 2.063 |
| -1.723999999999896 | -0.38 | 0.021 | 2.078 |
| -1.720999999999897 | -0.375 | 0.022 | 2.092 |
| -1.717999999999897 | -0.37 | 0.022 | 2.107 |
| -1.714999999999897 | -0.366 | 0.023 | 2.122 |
| -1.711999999999897 | -0.361 | 0.024 | 2.137 |
| -1.708999999999897 | -0.356 | 0.025 | 2.152 |
| -1.705999999999897 | -0.352 | 0.025 | 2.167 |
| -1.702999999999897 | -0.347 | 0.026 | 2.182 |
| -1.699999999999897 | -0.343 | 0.027 | 2.197 |
| -1.696999999999897 | -0.339 | 0.028 | 2.212 |
| -1.693999999999897 | -0.334 | 0.029 | 2.228 |
| -1.690999999999898 | -0.33 | 0.03 | 2.243 |
| -1.687999999999898 | -0.326 | 0.03 | 2.258 |
| -1.684999999999898 | -0.321 | 0.031 | 2.274 |
| -1.681999999999898 | -0.317 | 0.032 | 2.29 |
| -1.678999999999898 | -0.313 | 0.033 | 2.305 |
| -1.675999999999898 | -0.309 | 0.034 | 2.321 |
| -1.672999999999898 | -0.305 | 0.035 | 2.337 |
| -1.669999999999898 | -0.301 | 0.036 | 2.353 |
| -1.666999999999898 | -0.297 | 0.037 | 2.369 |
| -1.663999999999899 | -0.293 | 0.038 | 2.385 |
| -1.660999999999899 | -0.289 | 0.039 | 2.401 |
| -1.657999999999899 | -0.285 | 0.04 | 2.417 |
| -1.654999999999899 | -0.281 | 0.041 | 2.433 |
| -1.651999999999899 | -0.277 | 0.042 | 2.449 |
| -1.648999999999899 | -0.273 | 0.043 | 2.466 |
| -1.645999999999899 | -0.27 | 0.044 | 2.482 |
| -1.642999999999899 | -0.266 | 0.045 | 2.499 |
| -1.639999999999899 | -0.262 | 0.047 | 2.515 |
| -1.6369999999999 | -0.258 | 0.048 | 2.532 |
| -1.6339999999999 | -0.255 | 0.049 | 2.549 |
| -1.6309999999999 | -0.251 | 0.05 | 2.566 |
| -1.6279999999999 | -0.248 | 0.051 | 2.583 |
| -1.6249999999999 | -0.244 | 0.053 | 2.6 |
| -1.6219999999999 | -0.241 | 0.054 | 2.617 |
| -1.6189999999999 | -0.237 | 0.055 | 2.634 |
| -1.6159999999999 | -0.234 | 0.057 | 2.651 |
| -1.6129999999999 | -0.23 | 0.058 | 2.668 |
| -1.609999999999901 | -0.227 | 0.059 | 2.686 |
| -1.606999999999901 | -0.224 | 0.061 | 2.703 |
| -1.603999999999901 | -0.22 | 0.062 | 2.721 |
| -1.600999999999901 | -0.217 | 0.064 | 2.738 |
| -1.597999999999901 | -0.214 | 0.065 | 2.756 |
| -1.594999999999901 | -0.211 | 0.066 | 2.774 |
| -1.591999999999901 | -0.207 | 0.068 | 2.791 |
| -1.588999999999901 | -0.204 | 0.069 | 2.809 |
| -1.585999999999901 | -0.201 | 0.071 | 2.827 |
| -1.582999999999902 | -0.198 | 0.073 | 2.845 |
| -1.579999999999902 | -0.195 | 0.074 | 2.863 |
| -1.576999999999902 | -0.192 | 0.076 | 2.881 |
| -1.573999999999902 | -0.189 | 0.077 | 2.9 |
| -1.570999999999902 | -0.186 | 0.079 | 2.918 |
| -1.567999999999902 | -0.183 | 0.081 | 2.936 |
| -1.564999999999902 | -0.18 | 0.082 | 2.955 |
| -1.561999999999902 | -0.178 | 0.084 | 2.974 |
| -1.558999999999902 | -0.175 | 0.086 | 2.992 |
| -1.555999999999903 | -0.172 | 0.088 | 3.011 |
| -1.552999999999903 | -0.169 | 0.089 | 3.03 |
| -1.549999999999903 | -0.166 | 0.091 | 3.049 |
| -1.546999999999903 | -0.164 | 0.093 | 3.068 |
| -1.543999999999903 | -0.161 | 0.095 | 3.087 |
| -1.540999999999903 | -0.158 | 0.097 | 3.106 |
| -1.537999999999903 | -0.156 | 0.099 | 3.125 |
| -1.534999999999903 | -0.153 | 0.101 | 3.144 |
| -1.531999999999903 | -0.151 | 0.103 | 3.164 |
| -1.528999999999904 | -0.148 | 0.104 | 3.183 |
| -1.525999999999904 | -0.146 | 0.106 | 3.203 |
| -1.522999999999904 | -0.143 | 0.109 | 3.222 |
| -1.519999999999904 | -0.141 | 0.111 | 3.242 |
| -1.516999999999904 | -0.138 | 0.113 | 3.262 |
| -1.513999999999904 | -0.136 | 0.115 | 3.281 |
| -1.510999999999904 | -0.133 | 0.117 | 3.301 |
| -1.507999999999904 | -0.131 | 0.119 | 3.321 |
| -1.504999999999904 | -0.129 | 0.121 | 3.341 |
| -1.501999999999905 | -0.127 | 0.124 | 3.362 |
| -1.498999999999905 | -0.124 | 0.126 | 3.382 |
| -1.495999999999905 | -0.122 | 0.128 | 3.402 |
| -1.492999999999905 | -0.12 | 0.13 | 3.422 |
| -1.489999999999905 | -0.118 | 0.133 | 3.443 |
| -1.486999999999905 | -0.116 | 0.135 | 3.464 |
| -1.483999999999905 | -0.113 | 0.137 | 3.484 |
| -1.480999999999905 | -0.111 | 0.14 | 3.505 |
| -1.477999999999905 | -0.109 | 0.142 | 3.526 |
| -1.474999999999905 | -0.107 | 0.145 | 3.547 |
| -1.471999999999906 | -0.105 | 0.147 | 3.568 |
| -1.468999999999906 | -0.103 | 0.15 | 3.589 |
| -1.465999999999906 | -0.101 | 0.152 | 3.61 |
| -1.462999999999906 | -0.099 | 0.155 | 3.631 |
| -1.459999999999906 | -0.097 | 0.157 | 3.652 |
| -1.456999999999906 | -0.095 | 0.16 | 3.674 |
| -1.453999999999906 | -0.094 | 0.163 | 3.695 |
| -1.450999999999906 | -0.092 | 0.165 | 3.717 |
| -1.447999999999906 | -0.09 | 0.168 | 3.738 |
| -1.444999999999907 | -0.088 | 0.171 | 3.76 |
| -1.441999999999907 | -0.086 | 0.174 | 3.782 |
| -1.438999999999907 | -0.085 | 0.177 | 3.804 |
| -1.435999999999907 | -0.083 | 0.179 | 3.826 |
| -1.432999999999907 | -0.081 | 0.182 | 3.848 |
| -1.429999999999907 | -0.08 | 0.185 | 3.87 |
| -1.426999999999907 | -0.078 | 0.188 | 3.892 |
| -1.423999999999907 | -0.076 | 0.191 | 3.914 |
| -1.420999999999907 | -0.075 | 0.194 | 3.937 |
| -1.417999999999908 | -0.073 | 0.197 | 3.959 |
| -1.414999999999908 | -0.071 | 0.2 | 3.982 |
| -1.411999999999908 | -0.07 | 0.203 | 4.005 |
| -1.408999999999908 | -0.068 | 0.206 | 4.027 |
| -1.405999999999908 | -0.067 | 0.21 | 4.05 |
| -1.402999999999908 | -0.065 | 0.213 | 4.073 |
| -1.399999999999908 | -0.064 | 0.216 | 4.096 |
| -1.396999999999908 | -0.063 | 0.219 | 4.119 |
| -1.393999999999908 | -0.061 | 0.223 | 4.142 |
| -1.390999999999908 | -0.06 | 0.226 | 4.166 |
| -1.387999999999909 | -0.058 | 0.229 | 4.189 |
| -1.384999999999909 | -0.057 | 0.233 | 4.212 |
| -1.381999999999909 | -0.056 | 0.236 | 4.236 |
| -1.378999999999909 | -0.054 | 0.239 | 4.259 |
| -1.375999999999909 | -0.053 | 0.243 | 4.283 |
| -1.372999999999909 | -0.052 | 0.246 | 4.307 |
| -1.369999999999909 | -0.051 | 0.25 | 4.331 |
| -1.366999999999909 | -0.049 | 0.254 | 4.355 |
| -1.363999999999909 | -0.048 | 0.257 | 4.379 |
| -1.36099999999991 | -0.047 | 0.261 | 4.403 |
| -1.35799999999991 | -0.046 | 0.265 | 4.427 |
| -1.35499999999991 | -0.045 | 0.268 | 4.451 |
| -1.35199999999991 | -0.044 | 0.272 | 4.476 |
| -1.34899999999991 | -0.043 | 0.276 | 4.5 |
| -1.34599999999991 | -0.041 | 0.28 | 4.525 |
| -1.34299999999991 | -0.04 | 0.284 | 4.55 |
| -1.33999999999991 | -0.039 | 0.287 | 4.574 |
| -1.33699999999991 | -0.038 | 0.291 | 4.599 |
| -1.333999999999911 | -0.037 | 0.295 | 4.624 |
| -1.330999999999911 | -0.036 | 0.299 | 4.649 |
| -1.327999999999911 | -0.035 | 0.303 | 4.674 |
| -1.324999999999911 | -0.034 | 0.308 | 4.699 |
| -1.321999999999911 | -0.033 | 0.312 | 4.725 |
| -1.318999999999911 | -0.032 | 0.316 | 4.75 |
| -1.315999999999911 | -0.032 | 0.32 | 4.776 |
| -1.312999999999911 | -0.031 | 0.324 | 4.801 |
| -1.309999999999911 | -0.03 | 0.329 | 4.827 |
| -1.306999999999912 | -0.029 | 0.333 | 4.853 |
| -1.303999999999912 | -0.028 | 0.337 | 4.878 |
| -1.300999999999912 | -0.027 | 0.342 | 4.904 |
| -1.297999999999912 | -0.026 | 0.346 | 4.93 |
| -1.294999999999912 | -0.026 | 0.35 | 4.956 |
| -1.291999999999912 | -0.025 | 0.355 | 4.983 |
| -1.288999999999912 | -0.024 | 0.359 | 5.009 |
| -1.285999999999912 | -0.023 | 0.364 | 5.035 |
| -1.282999999999912 | -0.023 | 0.369 | 5.062 |
| -1.279999999999913 | -0.022 | 0.373 | 5.088 |
| -1.276999999999913 | -0.021 | 0.378 | 5.115 |
| -1.273999999999913 | -0.021 | 0.383 | 5.142 |
| -1.270999999999913 | -0.02 | 0.387 | 5.169 |
| -1.267999999999913 | -0.019 | 0.392 | 5.196 |
| -1.264999999999913 | -0.019 | 0.397 | 5.223 |
| -1.261999999999913 | -0.018 | 0.402 | 5.25 |
| -1.258999999999913 | -0.017 | 0.407 | 5.277 |
| -1.255999999999913 | -0.017 | 0.412 | 5.304 |
| -1.252999999999913 | -0.016 | 0.417 | 5.332 |
| -1.249999999999914 | -0.016 | 0.422 | 5.359 |
| -1.246999999999914 | -0.015 | 0.427 | 5.387 |
| -1.243999999999914 | -0.015 | 0.432 | 5.415 |
| -1.240999999999914 | -0.014 | 0.437 | 5.442 |
| -1.237999999999914 | -0.013 | 0.442 | 5.47 |
| -1.234999999999914 | -0.013 | 0.448 | 5.498 |
| -1.231999999999914 | -0.012 | 0.453 | 5.526 |
| -1.228999999999914 | -0.012 | 0.458 | 5.555 |
| -1.225999999999914 | -0.012 | 0.464 | 5.583 |
| -1.222999999999915 | -0.011 | 0.469 | 5.611 |
| -1.219999999999915 | -0.011 | 0.475 | 5.64 |
| -1.216999999999915 | -0.01 | 0.48 | 5.668 |
| -1.213999999999915 | -0.01 | 0.486 | 5.697 |
| -1.210999999999915 | -0.009 | 0.491 | 5.726 |
| -1.207999999999915 | -0.009 | 0.497 | 5.755 |
| -1.204999999999915 | -0.009 | 0.502 | 5.784 |
| -1.201999999999915 | -0.008 | 0.508 | 5.813 |
| -1.198999999999915 | -0.008 | 0.514 | 5.842 |
| -1.195999999999916 | -0.008 | 0.52 | 5.871 |
| -1.192999999999916 | -0.007 | 0.526 | 5.9 |
| -1.189999999999916 | -0.007 | 0.531 | 5.93 |
| -1.186999999999916 | -0.007 | 0.537 | 5.959 |
| -1.183999999999916 | -0.006 | 0.543 | 5.989 |
| -1.180999999999916 | -0.006 | 0.549 | 6.019 |
| -1.177999999999916 | -0.006 | 0.555 | 6.048 |
| -1.174999999999916 | -0.005 | 0.562 | 6.078 |
| -1.171999999999916 | -0.005 | 0.568 | 6.108 |
| -1.168999999999917 | -0.005 | 0.574 | 6.139 |
| -1.165999999999917 | -0.005 | 0.58 | 6.169 |
| -1.162999999999917 | -0.004 | 0.586 | 6.199 |
| -1.159999999999917 | -0.004 | 0.593 | 6.23 |
| -1.156999999999917 | -0.004 | 0.599 | 6.26 |
| -1.153999999999917 | -0.004 | 0.605 | 6.291 |
| -1.150999999999917 | -0.003 | 0.612 | 6.321 |
| -1.147999999999917 | -0.003 | 0.618 | 6.352 |
| -1.144999999999917 | -0.003 | 0.625 | 6.383 |
| -1.141999999999918 | -0.003 | 0.632 | 6.414 |
| -1.138999999999918 | -0.003 | 0.638 | 6.445 |
| -1.135999999999918 | -0.003 | 0.645 | 6.476 |
| -1.132999999999918 | -0.002 | 0.652 | 6.508 |
| -1.129999999999918 | -0.002 | 0.659 | 6.539 |
| -1.126999999999918 | -0.002 | 0.665 | 6.571 |
| -1.123999999999918 | -0.002 | 0.672 | 6.602 |
| -1.120999999999918 | -0.002 | 0.679 | 6.634 |
| -1.117999999999918 | -0.002 | 0.686 | 6.666 |
| -1.114999999999918 | -0.002 | 0.693 | 6.698 |
| -1.111999999999919 | -0.001 | 0.7 | 6.73 |
| -1.108999999999919 | -0.001 | 0.707 | 6.762 |
| -1.105999999999919 | -0.001 | 0.715 | 6.794 |
| -1.102999999999919 | -0.001 | 0.722 | 6.827 |
| -1.099999999999919 | -0.001 | 0.729 | 6.859 |
| -1.096999999999919 | -0.001 | 0.736 | 6.892 |
| -1.093999999999919 | -0.001 | 0.744 | 6.924 |
| -1.090999999999919 | -0.001 | 0.751 | 6.957 |
| -1.087999999999919 | -0.001 | 0.759 | 6.99 |
| -1.08499999999992 | -0.001 | 0.766 | 7.023 |
| -1.08199999999992 | -0.001 | 0.774 | 7.056 |
| -1.07899999999992 | 0 | 0.781 | 7.089 |
| -1.07599999999992 | 0 | 0.789 | 7.122 |
| -1.07299999999992 | 0 | 0.797 | 7.156 |
| -1.06999999999992 | 0 | 0.804 | 7.189 |
| -1.06699999999992 | 0 | 0.812 | 7.223 |
| -1.06399999999992 | 0 | 0.82 | 7.256 |
| -1.06099999999992 | 0 | 0.828 | 7.29 |
| -1.057999999999921 | 0 | 0.836 | 7.324 |
| -1.054999999999921 | 0 | 0.844 | 7.358 |
| -1.051999999999921 | 0 | 0.852 | 7.392 |
| -1.048999999999921 | 0 | 0.86 | 7.426 |
| -1.045999999999921 | 0 | 0.868 | 7.461 |
| -1.042999999999921 | 0 | 0.876 | 7.495 |
| -1.039999999999921 | 0 | 0.885 | 7.53 |
| -1.036999999999921 | 0 | 0.893 | 7.564 |
| -1.033999999999921 | 0 | 0.901 | 7.599 |
| -1.030999999999922 | 0 | 0.91 | 7.634 |
| -1.027999999999922 | 0 | 0.918 | 7.669 |
| -1.024999999999922 | 0 | 0.927 | 7.704 |
| -1.021999999999922 | 0 | 0.935 | 7.739 |
| -1.018999999999922 | 0 | 0.944 | 7.774 |
| -1.015999999999922 | 0 | 0.953 | 7.81 |
| -1.012999999999922 | 0 | 0.962 | 7.845 |
| -1.009999999999922 | 0 | 0.97 | 7.881 |
| -1.006999999999922 | 0 | 0.979 | 7.916 |
| -1.003999999999923 | 0 | 0.988 | 7.952 |
| -1.000999999999923 | 0 | 0.997 | 7.988 |
| -0.997999999999923 | 0 | 1.006 | 8.024 |
| -0.994999999999923 | 0 | 1.015 | 8.06 |
| -0.991999999999923 | 0 | 1.024 | 8.096 |
| -0.988999999999923 | 0 | 1.033 | 8.133 |
| -0.985999999999923 | 0 | 1.043 | 8.169 |
| -0.982999999999923 | 0 | 1.052 | 8.206 |
| -0.979999999999923 | 0 | 1.061 | 8.242 |
| -0.976999999999923 | 0 | 1.071 | 8.279 |
| -0.973999999999923 | 0 | 1.08 | 8.316 |
| -0.970999999999923 | 0 | 1.09 | 8.353 |
| -0.967999999999923 | 0 | 1.099 | 8.39 |
| -0.964999999999923 | 0 | 1.109 | 8.427 |
| -0.961999999999923 | 0 | 1.118 | 8.465 |
| -0.958999999999923 | 0 | 1.128 | 8.502 |
| -0.955999999999923 | 0 | 1.138 | 8.54 |
| -0.952999999999923 | 0 | 1.148 | 8.577 |
| -0.949999999999923 | 0 | 1.158 | 8.615 |
| -0.946999999999923 | 0 | 1.168 | 8.653 |
| -0.943999999999923 | 0 | 1.178 | 8.691 |
| -0.940999999999923 | 0 | 1.188 | 8.729 |
| -0.937999999999923 | 0 | 1.198 | 8.767 |
| -0.934999999999923 | 0 | 1.208 | 8.806 |
| -0.931999999999923 | 0 | 1.218 | 8.844 |
| -0.928999999999923 | 0 | 1.228 | 8.883 |
| -0.925999999999923 | 0 | 1.239 | 8.921 |
| -0.922999999999923 | 0 | 1.249 | 8.96 |
| -0.919999999999923 | 0.001 | 1.26 | 8.999 |
| -0.916999999999923 | 0.001 | 1.27 | 9.038 |
| -0.913999999999923 | 0.001 | 1.281 | 9.077 |
| -0.910999999999923 | 0.001 | 1.291 | 9.116 |
| -0.907999999999923 | 0.001 | 1.302 | 9.156 |
| -0.904999999999923 | 0.001 | 1.313 | 9.195 |
| -0.901999999999923 | 0.001 | 1.324 | 9.235 |
| -0.898999999999922 | 0.001 | 1.335 | 9.274 |
| -0.895999999999922 | 0.001 | 1.346 | 9.314 |
| -0.892999999999922 | 0.001 | 1.357 | 9.354 |
| -0.889999999999922 | 0.001 | 1.368 | 9.394 |
| -0.886999999999922 | 0.001 | 1.379 | 9.434 |
| -0.883999999999922 | 0.002 | 1.39 | 9.474 |
| -0.880999999999922 | 0.002 | 1.401 | 9.515 |
| -0.877999999999922 | 0.002 | 1.412 | 9.555 |
| -0.874999999999922 | 0.002 | 1.424 | 9.596 |
| -0.871999999999922 | 0.002 | 1.435 | 9.636 |
| -0.868999999999922 | 0.002 | 1.447 | 9.677 |
| -0.865999999999922 | 0.002 | 1.458 | 9.718 |
| -0.862999999999922 | 0.003 | 1.47 | 9.759 |
| -0.859999999999922 | 0.003 | 1.482 | 9.8 |
| -0.856999999999922 | 0.003 | 1.493 | 9.842 |
| -0.853999999999922 | 0.003 | 1.505 | 9.883 |
| -0.850999999999922 | 0.003 | 1.517 | 9.925 |
| -0.847999999999922 | 0.004 | 1.529 | 9.966 |
| -0.844999999999922 | 0.004 | 1.541 | 10.008 |
| -0.841999999999922 | 0.004 | 1.553 | 10.05 |
| -0.838999999999922 | 0.004 | 1.565 | 10.092 |
| -0.835999999999922 | 0.004 | 1.577 | 10.134 |
| -0.832999999999922 | 0.005 | 1.589 | 10.176 |
| -0.829999999999922 | 0.005 | 1.602 | 10.218 |
| -0.826999999999922 | 0.005 | 1.614 | 10.261 |
| -0.823999999999922 | 0.005 | 1.626 | 10.303 |
| -0.820999999999922 | 0.006 | 1.639 | 10.346 |
| -0.817999999999922 | 0.006 | 1.651 | 10.389 |
| -0.814999999999922 | 0.006 | 1.664 | 10.432 |
| -0.811999999999922 | 0.007 | 1.677 | 10.475 |
| -0.808999999999922 | 0.007 | 1.689 | 10.518 |
| -0.805999999999922 | 0.007 | 1.702 | 10.561 |
| -0.802999999999922 | 0.008 | 1.715 | 10.604 |
| -0.799999999999922 | 0.008 | 1.728 | 10.648 |
| -0.796999999999922 | 0.008 | 1.741 | 10.692 |
| -0.793999999999922 | 0.009 | 1.754 | 10.735 |
| -0.790999999999922 | 0.009 | 1.767 | 10.779 |
| -0.787999999999922 | 0.01 | 1.78 | 10.823 |
| -0.784999999999922 | 0.01 | 1.794 | 10.867 |
| -0.781999999999922 | 0.01 | 1.807 | 10.912 |
| -0.778999999999922 | 0.011 | 1.82 | 10.956 |
| -0.775999999999922 | 0.011 | 1.834 | 11 |
| -0.772999999999922 | 0.012 | 1.847 | 11.045 |
| -0.769999999999922 | 0.012 | 1.861 | 11.09 |
| -0.766999999999922 | 0.013 | 1.875 | 11.134 |
| -0.763999999999922 | 0.013 | 1.888 | 11.179 |
| -0.760999999999922 | 0.014 | 1.902 | 11.224 |
| -0.757999999999922 | 0.014 | 1.916 | 11.27 |
| -0.754999999999922 | 0.015 | 1.93 | 11.315 |
| -0.751999999999922 | 0.015 | 1.944 | 11.36 |
| -0.748999999999922 | 0.016 | 1.958 | 11.406 |
| -0.745999999999922 | 0.016 | 1.972 | 11.451 |
| -0.742999999999922 | 0.017 | 1.986 | 11.497 |
| -0.739999999999922 | 0.018 | 2 | 11.543 |
| -0.736999999999922 | 0.018 | 2.015 | 11.589 |
| -0.733999999999922 | 0.019 | 2.029 | 11.635 |
| -0.730999999999922 | 0.019 | 2.044 | 11.682 |
| -0.727999999999922 | 0.02 | 2.058 | 11.728 |
| -0.724999999999922 | 0.021 | 2.073 | 11.775 |
| -0.721999999999922 | 0.021 | 2.087 | 11.821 |
| -0.718999999999922 | 0.022 | 2.102 | 11.868 |
| -0.715999999999922 | 0.023 | 2.117 | 11.915 |
| -0.712999999999922 | 0.024 | 2.132 | 11.962 |
| -0.709999999999922 | 0.024 | 2.147 | 12.009 |
| -0.706999999999922 | 0.025 | 2.162 | 12.056 |
| -0.703999999999922 | 0.026 | 2.177 | 12.104 |
| -0.700999999999922 | 0.027 | 2.192 | 12.151 |
| -0.697999999999922 | 0.028 | 2.207 | 12.199 |
| -0.694999999999922 | 0.028 | 2.222 | 12.247 |
| -0.691999999999922 | 0.029 | 2.238 | 12.294 |
| -0.688999999999922 | 0.03 | 2.253 | 12.342 |
| -0.685999999999922 | 0.031 | 2.269 | 12.391 |
| -0.682999999999922 | 0.032 | 2.284 | 12.439 |
| -0.679999999999922 | 0.033 | 2.3 | 12.487 |
| -0.676999999999922 | 0.034 | 2.316 | 12.536 |
| -0.673999999999922 | 0.035 | 2.331 | 12.584 |
| -0.670999999999922 | 0.036 | 2.347 | 12.633 |
| -0.667999999999922 | 0.037 | 2.363 | 12.682 |
| -0.664999999999922 | 0.038 | 2.379 | 12.731 |
| -0.661999999999922 | 0.039 | 2.395 | 12.78 |
| -0.658999999999922 | 0.04 | 2.411 | 12.829 |
| -0.655999999999922 | 0.041 | 2.428 | 12.879 |
| -0.652999999999922 | 0.042 | 2.444 | 12.928 |
| -0.649999999999922 | 0.043 | 2.46 | 12.978 |
| -0.646999999999922 | 0.044 | 2.477 | 13.028 |
| -0.643999999999922 | 0.045 | 2.493 | 13.078 |
| -0.640999999999922 | 0.046 | 2.51 | 13.128 |
| -0.637999999999922 | 0.047 | 2.527 | 13.178 |
| -0.634999999999922 | 0.049 | 2.543 | 13.228 |
| -0.631999999999922 | 0.05 | 2.56 | 13.278 |
| -0.628999999999922 | 0.051 | 2.577 | 13.329 |
| -0.625999999999922 | 0.052 | 2.594 | 13.38 |
| -0.622999999999922 | 0.054 | 2.611 | 13.43 |
| -0.619999999999922 | 0.055 | 2.628 | 13.481 |
| -0.616999999999922 | 0.056 | 2.645 | 13.532 |
| -0.613999999999922 | 0.058 | 2.663 | 13.583 |
| -0.610999999999922 | 0.059 | 2.68 | 13.635 |
| -0.607999999999922 | 0.06 | 2.697 | 13.686 |
| -0.604999999999922 | 0.062 | 2.715 | 13.738 |
| -0.601999999999922 | 0.063 | 2.732 | 13.789 |
| -0.598999999999922 | 0.064 | 2.75 | 13.841 |
| -0.595999999999922 | 0.066 | 2.768 | 13.893 |
| -0.592999999999922 | 0.067 | 2.785 | 13.945 |
| -0.589999999999922 | 0.069 | 2.803 | 13.998 |
| -0.586999999999922 | 0.07 | 2.821 | 14.05 |
| -0.583999999999922 | 0.072 | 2.839 | 14.102 |
| -0.580999999999922 | 0.074 | 2.857 | 14.155 |
| -0.577999999999922 | 0.075 | 2.875 | 14.208 |
| -0.574999999999922 | 0.077 | 2.894 | 14.261 |
| -0.571999999999922 | 0.078 | 2.912 | 14.314 |
| -0.568999999999922 | 0.08 | 2.93 | 14.367 |
| -0.565999999999922 | 0.082 | 2.949 | 14.42 |
| -0.562999999999922 | 0.083 | 2.967 | 14.473 |
| -0.559999999999922 | 0.085 | 2.986 | 14.527 |
| -0.556999999999922 | 0.087 | 3.005 | 14.58 |
| -0.553999999999922 | 0.089 | 3.023 | 14.634 |
| -0.550999999999922 | 0.091 | 3.042 | 14.688 |
| -0.547999999999922 | 0.092 | 3.061 | 14.742 |
| -0.544999999999922 | 0.094 | 3.08 | 14.796 |
| -0.541999999999922 | 0.096 | 3.099 | 14.851 |
| -0.538999999999922 | 0.098 | 3.119 | 14.905 |
| -0.535999999999922 | 0.1 | 3.138 | 14.96 |
| -0.532999999999922 | 0.102 | 3.157 | 15.014 |
| -0.529999999999922 | 0.104 | 3.177 | 15.069 |
| -0.526999999999922 | 0.106 | 3.196 | 15.124 |
| -0.523999999999922 | 0.108 | 3.216 | 15.179 |
| -0.520999999999922 | 0.11 | 3.235 | 15.235 |
| -0.517999999999922 | 0.112 | 3.255 | 15.29 |
| -0.514999999999922 | 0.114 | 3.275 | 15.345 |
| -0.511999999999922 | 0.116 | 3.295 | 15.401 |
| -0.508999999999922 | 0.118 | 3.315 | 15.457 |
| -0.505999999999922 | 0.121 | 3.335 | 15.513 |
| -0.502999999999922 | 0.123 | 3.355 | 15.569 |
| -0.499999999999922 | 0.125 | 3.375 | 15.625 |
| -0.496999999999922 | 0.127 | 3.395 | 15.681 |
| -0.493999999999922 | 0.13 | 3.416 | 15.738 |
| -0.490999999999922 | 0.132 | 3.436 | 15.794 |
| -0.487999999999922 | 0.134 | 3.457 | 15.851 |
| -0.484999999999922 | 0.137 | 3.477 | 15.908 |
| -0.481999999999922 | 0.139 | 3.498 | 15.965 |
| -0.478999999999922 | 0.141 | 3.519 | 16.022 |
| -0.475999999999922 | 0.144 | 3.54 | 16.079 |
| -0.472999999999922 | 0.146 | 3.561 | 16.137 |
| -0.469999999999922 | 0.149 | 3.582 | 16.194 |
| -0.466999999999922 | 0.151 | 3.603 | 16.252 |
| -0.463999999999922 | 0.154 | 3.624 | 16.31 |
| -0.460999999999922 | 0.157 | 3.645 | 16.368 |
| -0.457999999999922 | 0.159 | 3.667 | 16.426 |
| -0.454999999999922 | 0.162 | 3.688 | 16.484 |
| -0.451999999999922 | 0.165 | 3.709 | 16.542 |
| -0.448999999999922 | 0.167 | 3.731 | 16.601 |
| -0.445999999999922 | 0.17 | 3.753 | 16.66 |
| -0.442999999999922 | 0.173 | 3.775 | 16.718 |
| -0.439999999999922 | 0.176 | 3.796 | 16.777 |
| -0.436999999999922 | 0.178 | 3.818 | 16.836 |
| -0.433999999999922 | 0.181 | 3.84 | 16.895 |
| -0.430999999999922 | 0.184 | 3.863 | 16.955 |
| -0.427999999999922 | 0.187 | 3.885 | 17.014 |
| -0.424999999999922 | 0.19 | 3.907 | 17.074 |
| -0.421999999999922 | 0.193 | 3.929 | 17.134 |
| -0.418999999999922 | 0.196 | 3.952 | 17.193 |
| -0.415999999999922 | 0.199 | 3.974 | 17.254 |
| -0.412999999999922 | 0.202 | 3.997 | 17.314 |
| -0.409999999999922 | 0.205 | 4.02 | 17.374 |
| -0.406999999999922 | 0.209 | 4.042 | 17.434 |
| -0.403999999999922 | 0.212 | 4.065 | 17.495 |
| -0.400999999999922 | 0.215 | 4.088 | 17.556 |
| -0.397999999999922 | 0.218 | 4.111 | 17.617 |
| -0.394999999999922 | 0.221 | 4.135 | 17.678 |
| -0.391999999999922 | 0.225 | 4.158 | 17.739 |
| -0.388999999999922 | 0.228 | 4.181 | 17.8 |
| -0.385999999999922 | 0.231 | 4.204 | 17.861 |
| -0.382999999999922 | 0.235 | 4.228 | 17.923 |
| -0.379999999999922 | 0.238 | 4.252 | 17.985 |
| -0.376999999999922 | 0.242 | 4.275 | 18.047 |
| -0.373999999999922 | 0.245 | 4.299 | 18.109 |
| -0.370999999999922 | 0.249 | 4.323 | 18.171 |
| -0.367999999999922 | 0.252 | 4.347 | 18.233 |
| -0.364999999999922 | 0.256 | 4.371 | 18.295 |
| -0.361999999999922 | 0.26 | 4.395 | 18.358 |
| -0.358999999999922 | 0.263 | 4.419 | 18.421 |
| -0.355999999999922 | 0.267 | 4.443 | 18.484 |
| -0.352999999999922 | 0.271 | 4.468 | 18.546 |
| -0.349999999999922 | 0.275 | 4.492 | 18.61 |
| -0.346999999999922 | 0.278 | 4.517 | 18.673 |
| -0.343999999999922 | 0.282 | 4.541 | 18.736 |
| -0.340999999999922 | 0.286 | 4.566 | 18.8 |
| -0.337999999999922 | 0.29 | 4.591 | 18.864 |
| -0.334999999999922 | 0.294 | 4.616 | 18.927 |
| -0.331999999999922 | 0.298 | 4.641 | 18.991 |
| -0.328999999999922 | 0.302 | 4.666 | 19.056 |
| -0.325999999999922 | 0.306 | 4.691 | 19.12 |
| -0.322999999999922 | 0.31 | 4.716 | 19.184 |
| -0.319999999999922 | 0.314 | 4.742 | 19.249 |
| -0.316999999999922 | 0.319 | 4.767 | 19.314 |
| -0.313999999999922 | 0.323 | 4.793 | 19.378 |
| -0.310999999999922 | 0.327 | 4.818 | 19.443 |
| -0.307999999999922 | 0.331 | 4.844 | 19.509 |
| -0.304999999999922 | 0.336 | 4.87 | 19.574 |
| -0.301999999999922 | 0.34 | 4.896 | 19.639 |
| -0.298999999999922 | 0.344 | 4.922 | 19.705 |
| -0.295999999999922 | 0.349 | 4.948 | 19.771 |
| -0.292999999999922 | 0.353 | 4.974 | 19.836 |
| -0.289999999999922 | 0.358 | 5 | 19.903 |
| -0.286999999999922 | 0.362 | 5.027 | 19.969 |
| -0.283999999999922 | 0.367 | 5.053 | 20.035 |
| -0.280999999999922 | 0.372 | 5.08 | 20.101 |
| -0.277999999999922 | 0.376 | 5.106 | 20.168 |
| -0.274999999999922 | 0.381 | 5.133 | 20.235 |
| -0.271999999999922 | 0.386 | 5.16 | 20.302 |
| -0.268999999999922 | 0.391 | 5.187 | 20.369 |
| -0.265999999999922 | 0.395 | 5.214 | 20.436 |
| -0.262999999999922 | 0.4 | 5.241 | 20.503 |
| -0.259999999999922 | 0.405 | 5.268 | 20.571 |
| -0.256999999999922 | 0.41 | 5.295 | 20.638 |
| -0.253999999999922 | 0.415 | 5.323 | 20.706 |
| -0.250999999999922 | 0.42 | 5.35 | 20.774 |
| -0.247999999999922 | 0.425 | 5.378 | 20.842 |
| -0.244999999999922 | 0.43 | 5.405 | 20.911 |
| -0.241999999999922 | 0.436 | 5.433 | 20.979 |
| -0.238999999999922 | 0.441 | 5.461 | 21.047 |
| -0.235999999999922 | 0.446 | 5.489 | 21.116 |
| -0.232999999999922 | 0.451 | 5.517 | 21.185 |
| -0.229999999999922 | 0.457 | 5.545 | 21.254 |
| -0.226999999999922 | 0.462 | 5.573 | 21.323 |
| -0.223999999999922 | 0.467 | 5.602 | 21.392 |
| -0.220999999999922 | 0.473 | 5.63 | 21.462 |
| -0.217999999999922 | 0.478 | 5.659 | 21.531 |
| -0.214999999999922 | 0.484 | 5.687 | 21.601 |
| -0.211999999999922 | 0.489 | 5.716 | 21.671 |
| -0.208999999999922 | 0.495 | 5.745 | 21.741 |
| -0.205999999999922 | 0.501 | 5.774 | 21.811 |
| -0.202999999999922 | 0.506 | 5.803 | 21.882 |
| -0.199999999999922 | 0.512 | 5.832 | 21.952 |
| -0.196999999999922 | 0.518 | 5.861 | 22.023 |
| -0.193999999999922 | 0.524 | 5.891 | 22.093 |
| -0.190999999999922 | 0.529 | 5.92 | 22.164 |
| -0.187999999999922 | 0.535 | 5.949 | 22.235 |
| -0.184999999999922 | 0.541 | 5.979 | 22.307 |
| -0.181999999999922 | 0.547 | 6.009 | 22.378 |
| -0.178999999999922 | 0.553 | 6.039 | 22.45 |
| -0.175999999999922 | 0.559 | 6.068 | 22.521 |
| -0.172999999999922 | 0.566 | 6.098 | 22.593 |
| -0.169999999999922 | 0.572 | 6.128 | 22.665 |
| -0.166999999999922 | 0.578 | 6.159 | 22.737 |
| -0.163999999999922 | 0.584 | 6.189 | 22.81 |
| -0.160999999999922 | 0.591 | 6.219 | 22.882 |
| -0.157999999999922 | 0.597 | 6.25 | 22.955 |
| -0.154999999999922 | 0.603 | 6.28 | 23.028 |
| -0.151999999999922 | 0.61 | 6.311 | 23.1 |
| -0.148999999999922 | 0.616 | 6.342 | 23.174 |
| -0.145999999999922 | 0.623 | 6.373 | 23.247 |
| -0.142999999999922 | 0.629 | 6.404 | 23.32 |
| -0.139999999999922 | 0.636 | 6.435 | 23.394 |
| -0.136999999999922 | 0.643 | 6.466 | 23.467 |
| -0.133999999999922 | 0.649 | 6.497 | 23.541 |
| -0.130999999999922 | 0.656 | 6.529 | 23.615 |
| -0.127999999999922 | 0.663 | 6.56 | 23.689 |
| -0.124999999999922 | 0.67 | 6.592 | 23.764 |
| -0.121999999999922 | 0.677 | 6.623 | 23.838 |
| -0.118999999999922 | 0.684 | 6.655 | 23.913 |
| -0.115999999999922 | 0.691 | 6.687 | 23.988 |
| -0.112999999999922 | 0.698 | 6.719 | 24.062 |
| -0.109999999999922 | 0.705 | 6.751 | 24.138 |
| -0.106999999999922 | 0.712 | 6.783 | 24.213 |
| -0.103999999999922 | 0.719 | 6.816 | 24.288 |
| -0.100999999999922 | 0.727 | 6.848 | 24.364 |
| -0.0979999999999218 | 0.734 | 6.881 | 24.439 |
| -0.0949999999999218 | 0.741 | 6.913 | 24.515 |
| -0.0919999999999218 | 0.749 | 6.946 | 24.591 |
| -0.0889999999999218 | 0.756 | 6.979 | 24.668 |
| -0.0859999999999218 | 0.764 | 7.012 | 24.744 |
| -0.0829999999999218 | 0.771 | 7.045 | 24.82 |
| -0.0799999999999218 | 0.779 | 7.078 | 24.897 |
| -0.0769999999999218 | 0.786 | 7.111 | 24.974 |
| -0.0739999999999218 | 0.794 | 7.144 | 25.051 |
| -0.0709999999999218 | 0.802 | 7.178 | 25.128 |
| -0.0679999999999218 | 0.81 | 7.211 | 25.205 |
| -0.0649999999999218 | 0.817 | 7.245 | 25.283 |
| -0.0619999999999218 | 0.825 | 7.279 | 25.36 |
| -0.0589999999999218 | 0.833 | 7.313 | 25.438 |
| -0.0559999999999218 | 0.841 | 7.347 | 25.516 |
| -0.0529999999999218 | 0.849 | 7.381 | 25.594 |
| -0.0499999999999218 | 0.857 | 7.415 | 25.672 |
| -0.0469999999999218 | 0.866 | 7.449 | 25.751 |
| -0.0439999999999218 | 0.874 | 7.484 | 25.829 |
| -0.0409999999999218 | 0.882 | 7.518 | 25.908 |
| -0.0379999999999218 | 0.89 | 7.553 | 25.987 |
| -0.0349999999999218 | 0.899 | 7.587 | 26.066 |
| -0.0319999999999218 | 0.907 | 7.622 | 26.145 |
| -0.0289999999999218 | 0.915 | 7.657 | 26.225 |
| -0.0259999999999218 | 0.924 | 7.692 | 26.304 |
| -0.0229999999999218 | 0.933 | 7.727 | 26.384 |
| -0.0199999999999218 | 0.941 | 7.762 | 26.464 |
| -0.0169999999999218 | 0.95 | 7.798 | 26.544 |
| -0.0139999999999218 | 0.959 | 7.833 | 26.624 |
| -0.0109999999999218 | 0.967 | 7.869 | 26.704 |
| -0.00799999999992176 | 0.976 | 7.904 | 26.785 |
| -0.00499999999992176 | 0.985 | 7.94 | 26.865 |
| -0.00199999999992176 | 0.994 | 7.976 | 26.946 |
| 0.00100000000007824 | 1.003 | 8.012 | 27.027 |
| 0.00400000000007824 | 1.012 | 8.048 | 27.108 |
| 0.00700000000007823 | 1.021 | 8.084 | 27.189 |
| 0.0100000000000782 | 1.03 | 8.121 | 27.271 |
| 0.0130000000000782 | 1.04 | 8.157 | 27.353 |
| 0.0160000000000782 | 1.049 | 8.194 | 27.434 |
| 0.0190000000000782 | 1.058 | 8.23 | 27.516 |
| 0.0220000000000782 | 1.067 | 8.267 | 27.598 |
| 0.0250000000000782 | 1.077 | 8.304 | 27.681 |
| 0.0280000000000782 | 1.086 | 8.341 | 27.763 |
| 0.0310000000000782 | 1.096 | 8.378 | 27.846 |
| 0.0340000000000782 | 1.106 | 8.415 | 27.928 |
| 0.0370000000000782 | 1.115 | 8.452 | 28.011 |
| 0.0400000000000782 | 1.125 | 8.49 | 28.094 |
| 0.0430000000000782 | 1.135 | 8.527 | 28.178 |
| 0.0460000000000782 | 1.144 | 8.565 | 28.261 |
| 0.0490000000000782 | 1.154 | 8.603 | 28.345 |
| 0.0520000000000782 | 1.164 | 8.64 | 28.428 |
| 0.0550000000000782 | 1.174 | 8.678 | 28.512 |
| 0.0580000000000782 | 1.184 | 8.716 | 28.596 |
| 0.0610000000000782 | 1.194 | 8.755 | 28.681 |
| 0.0640000000000782 | 1.205 | 8.793 | 28.765 |
| 0.0670000000000782 | 1.215 | 8.831 | 28.85 |
| 0.0700000000000783 | 1.225 | 8.87 | 28.934 |
| 0.0730000000000783 | 1.235 | 8.908 | 29.019 |
| 0.0760000000000783 | 1.246 | 8.947 | 29.104 |
| 0.0790000000000783 | 1.256 | 8.986 | 29.19 |
| 0.0820000000000783 | 1.267 | 9.025 | 29.275 |
| 0.0850000000000783 | 1.277 | 9.064 | 29.361 |
| 0.0880000000000783 | 1.288 | 9.103 | 29.446 |
| 0.0910000000000783 | 1.299 | 9.142 | 29.532 |
| 0.0940000000000783 | 1.309 | 9.182 | 29.618 |
| 0.0970000000000783 | 1.32 | 9.221 | 29.705 |
| 0.100000000000078 | 1.331 | 9.261 | 29.791 |
| 0.103000000000078 | 1.342 | 9.301 | 29.878 |
| 0.106000000000078 | 1.353 | 9.341 | 29.964 |
| 0.109000000000078 | 1.364 | 9.381 | 30.051 |
| 0.112000000000078 | 1.375 | 9.421 | 30.138 |
| 0.115000000000078 | 1.386 | 9.461 | 30.226 |
| 0.118000000000078 | 1.397 | 9.501 | 30.313 |
| 0.121000000000078 | 1.409 | 9.542 | 30.401 |
| 0.124000000000078 | 1.42 | 9.582 | 30.488 |
| 0.127000000000078 | 1.431 | 9.623 | 30.576 |
| 0.130000000000078 | 1.443 | 9.664 | 30.664 |
| 0.133000000000078 | 1.454 | 9.704 | 30.753 |
| 0.136000000000078 | 1.466 | 9.745 | 30.841 |
| 0.139000000000078 | 1.478 | 9.787 | 30.93 |
| 0.142000000000078 | 1.489 | 9.828 | 31.018 |
| 0.145000000000078 | 1.501 | 9.869 | 31.107 |
| 0.148000000000078 | 1.513 | 9.911 | 31.196 |
| 0.151000000000078 | 1.525 | 9.952 | 31.286 |
| 0.154000000000078 | 1.537 | 9.994 | 31.375 |
| 0.157000000000078 | 1.549 | 10.036 | 31.465 |
| 0.160000000000078 | 1.561 | 10.078 | 31.554 |
| 0.163000000000078 | 1.573 | 10.12 | 31.644 |
| 0.166000000000078 | 1.585 | 10.162 | 31.735 |
| 0.169000000000078 | 1.598 | 10.204 | 31.825 |
| 0.172000000000078 | 1.61 | 10.247 | 31.915 |
| 0.175000000000078 | 1.622 | 10.289 | 32.006 |
| 0.178000000000078 | 1.635 | 10.332 | 32.097 |
| 0.181000000000078 | 1.647 | 10.374 | 32.188 |
| 0.184000000000078 | 1.66 | 10.417 | 32.279 |
| 0.187000000000078 | 1.672 | 10.46 | 32.37 |
| 0.190000000000078 | 1.685 | 10.503 | 32.462 |
| 0.193000000000078 | 1.698 | 10.547 | 32.553 |
| 0.196000000000078 | 1.711 | 10.59 | 32.645 |
| 0.199000000000078 | 1.724 | 10.633 | 32.737 |
| 0.202000000000078 | 1.737 | 10.677 | 32.829 |
| 0.205000000000078 | 1.75 | 10.721 | 32.922 |
| 0.208000000000078 | 1.763 | 10.765 | 33.014 |
| 0.211000000000078 | 1.776 | 10.809 | 33.107 |
| 0.214000000000078 | 1.789 | 10.853 | 33.2 |
| 0.217000000000078 | 1.802 | 10.897 | 33.293 |
| 0.220000000000078 | 1.816 | 10.941 | 33.386 |
| 0.223000000000078 | 1.829 | 10.985 | 33.48 |
| 0.226000000000078 | 1.843 | 11.03 | 33.573 |
| 0.229000000000078 | 1.856 | 11.075 | 33.667 |
| 0.232000000000078 | 1.87 | 11.119 | 33.761 |
| 0.235000000000078 | 1.884 | 11.164 | 33.855 |
| 0.238000000000078 | 1.897 | 11.209 | 33.949 |
| 0.241000000000078 | 1.911 | 11.254 | 34.044 |
| 0.244000000000078 | 1.925 | 11.3 | 34.138 |
| 0.247000000000078 | 1.939 | 11.345 | 34.233 |
| 0.250000000000078 | 1.953 | 11.391 | 34.328 |
| 0.253000000000078 | 1.967 | 11.436 | 34.423 |
| 0.256000000000078 | 1.981 | 11.482 | 34.519 |
| 0.259000000000078 | 1.996 | 11.528 | 34.614 |
| 0.262000000000078 | 2.01 | 11.574 | 34.71 |
| 0.265000000000078 | 2.024 | 11.62 | 34.806 |
| 0.268000000000078 | 2.039 | 11.666 | 34.902 |
| 0.271000000000078 | 2.053 | 11.713 | 34.998 |
| 0.274000000000078 | 2.068 | 11.759 | 35.094 |
| 0.277000000000078 | 2.082 | 11.806 | 35.191 |
| 0.280000000000078 | 2.097 | 11.852 | 35.288 |
| 0.283000000000078 | 2.112 | 11.899 | 35.384 |
| 0.286000000000078 | 2.127 | 11.946 | 35.482 |
| 0.289000000000078 | 2.142 | 11.993 | 35.579 |
| 0.292000000000078 | 2.157 | 12.04 | 35.676 |
| 0.295000000000078 | 2.172 | 12.088 | 35.774 |
| 0.298000000000078 | 2.187 | 12.135 | 35.872 |
| 0.301000000000078 | 2.202 | 12.183 | 35.97 |
| 0.304000000000078 | 2.217 | 12.231 | 36.068 |
| 0.307000000000078 | 2.233 | 12.278 | 36.166 |
| 0.310000000000078 | 2.248 | 12.326 | 36.265 |
| 0.313000000000078 | 2.264 | 12.374 | 36.363 |
| 0.316000000000078 | 2.279 | 12.423 | 36.462 |
| 0.319000000000078 | 2.295 | 12.471 | 36.561 |
| 0.322000000000078 | 2.31 | 12.519 | 36.661 |
| 0.325000000000078 | 2.326 | 12.568 | 36.76 |
| 0.328000000000078 | 2.342 | 12.617 | 36.86 |
| 0.331000000000078 | 2.358 | 12.666 | 36.959 |
| 0.334000000000078 | 2.374 | 12.715 | 37.059 |
| 0.337000000000078 | 2.39 | 12.764 | 37.159 |
| 0.340000000000078 | 2.406 | 12.813 | 37.26 |
| 0.343000000000078 | 2.422 | 12.862 | 37.36 |
| 0.346000000000078 | 2.439 | 12.912 | 37.461 |
| 0.349000000000078 | 2.455 | 12.961 | 37.562 |
| 0.352000000000078 | 2.471 | 13.011 | 37.663 |
| 0.355000000000078 | 2.488 | 13.061 | 37.764 |
| 0.358000000000078 | 2.504 | 13.111 | 37.865 |
| 0.361000000000078 | 2.521 | 13.161 | 37.967 |
| 0.364000000000078 | 2.538 | 13.211 | 38.069 |
| 0.367000000000078 | 2.554 | 13.262 | 38.171 |
| 0.370000000000078 | 2.571 | 13.312 | 38.273 |
| 0.373000000000078 | 2.588 | 13.363 | 38.375 |
| 0.376000000000078 | 2.605 | 13.413 | 38.478 |
| 0.379000000000078 | 2.622 | 13.464 | 38.58 |
| 0.382000000000078 | 2.64 | 13.515 | 38.683 |
| 0.385000000000078 | 2.657 | 13.566 | 38.786 |
| 0.388000000000078 | 2.674 | 13.618 | 38.889 |
| 0.391000000000078 | 2.691 | 13.669 | 38.993 |
| 0.394000000000078 | 2.709 | 13.721 | 39.096 |
| 0.397000000000078 | 2.726 | 13.772 | 39.2 |
| 0.400000000000078 | 2.744 | 13.824 | 39.304 |
| 0.403000000000078 | 2.762 | 13.876 | 39.408 |
| 0.406000000000078 | 2.779 | 13.928 | 39.512 |
| 0.409000000000078 | 2.797 | 13.98 | 39.617 |
| 0.412000000000079 | 2.815 | 14.032 | 39.722 |
| 0.415000000000079 | 2.833 | 14.085 | 39.826 |
| 0.418000000000079 | 2.851 | 14.137 | 39.932 |
| 0.421000000000079 | 2.869 | 14.19 | 40.037 |
| 0.424000000000079 | 2.888 | 14.243 | 40.142 |
| 0.427000000000079 | 2.906 | 14.296 | 40.248 |
| 0.430000000000079 | 2.924 | 14.349 | 40.354 |
| 0.433000000000079 | 2.943 | 14.402 | 40.46 |
| 0.436000000000079 | 2.961 | 14.455 | 40.566 |
| 0.439000000000079 | 2.98 | 14.509 | 40.672 |
| 0.442000000000079 | 2.998 | 14.563 | 40.779 |
| 0.445000000000079 | 3.017 | 14.616 | 40.885 |
| 0.448000000000079 | 3.036 | 14.67 | 40.992 |
| 0.451000000000079 | 3.055 | 14.724 | 41.099 |
| 0.454000000000079 | 3.074 | 14.778 | 41.207 |
| 0.457000000000079 | 3.093 | 14.833 | 41.314 |
| 0.460000000000079 | 3.112 | 14.887 | 41.422 |
| 0.463000000000079 | 3.131 | 14.941 | 41.53 |
| 0.466000000000079 | 3.151 | 14.996 | 41.638 |
| 0.469000000000079 | 3.17 | 15.051 | 41.746 |
| 0.472000000000079 | 3.19 | 15.106 | 41.854 |
| 0.475000000000079 | 3.209 | 15.161 | 41.963 |
| 0.478000000000079 | 3.229 | 15.216 | 42.072 |
| 0.481000000000079 | 3.248 | 15.271 | 42.181 |
| 0.484000000000079 | 3.268 | 15.327 | 42.29 |
| 0.487000000000079 | 3.288 | 15.383 | 42.399 |
| 0.490000000000079 | 3.308 | 15.438 | 42.509 |
| 0.493000000000079 | 3.328 | 15.494 | 42.618 |
| 0.496000000000079 | 3.348 | 15.55 | 42.728 |
| 0.499000000000079 | 3.368 | 15.606 | 42.838 |
| 0.502000000000079 | 3.389 | 15.663 | 42.949 |
| 0.505000000000079 | 3.409 | 15.719 | 43.059 |
| 0.508000000000079 | 3.429 | 15.775 | 43.17 |
| 0.511000000000079 | 3.45 | 15.832 | 43.281 |
| 0.514000000000079 | 3.47 | 15.889 | 43.392 |
| 0.517000000000079 | 3.491 | 15.946 | 43.503 |
| 0.520000000000079 | 3.512 | 16.003 | 43.614 |
| 0.523000000000079 | 3.533 | 16.06 | 43.726 |
| 0.526000000000079 | 3.554 | 16.118 | 43.838 |
| 0.529000000000079 | 3.575 | 16.175 | 43.95 |
| 0.532000000000079 | 3.596 | 16.233 | 44.062 |
| 0.535000000000079 | 3.617 | 16.29 | 44.174 |
| 0.538000000000079 | 3.638 | 16.348 | 44.287 |
| 0.541000000000079 | 3.659 | 16.406 | 44.399 |
| 0.544000000000079 | 3.681 | 16.465 | 44.512 |
| 0.547000000000079 | 3.702 | 16.523 | 44.626 |
| 0.550000000000079 | 3.724 | 16.581 | 44.739 |
| 0.553000000000079 | 3.746 | 16.64 | 44.852 |
| 0.556000000000079 | 3.767 | 16.699 | 44.966 |
| 0.559000000000079 | 3.789 | 16.758 | 45.08 |
| 0.562000000000079 | 3.811 | 16.817 | 45.194 |
| 0.565000000000079 | 3.833 | 16.876 | 45.308 |
| 0.568000000000079 | 3.855 | 16.935 | 45.423 |
| 0.571000000000079 | 3.877 | 16.994 | 45.538 |
| 0.574000000000079 | 3.9 | 17.054 | 45.652 |
| 0.577000000000079 | 3.922 | 17.114 | 45.767 |
| 0.580000000000079 | 3.944 | 17.174 | 45.883 |
| 0.583000000000079 | 3.967 | 17.233 | 45.998 |
| 0.586000000000079 | 3.989 | 17.294 | 46.114 |
| 0.589000000000079 | 4.012 | 17.354 | 46.23 |
| 0.592000000000079 | 4.035 | 17.414 | 46.346 |
| 0.595000000000079 | 4.058 | 17.475 | 46.462 |
| 0.598000000000079 | 4.081 | 17.535 | 46.578 |
| 0.601000000000079 | 4.104 | 17.596 | 46.695 |
| 0.604000000000079 | 4.127 | 17.657 | 46.812 |
| 0.607000000000079 | 4.15 | 17.718 | 46.929 |
| 0.610000000000079 | 4.173 | 17.78 | 47.046 |
| 0.613000000000079 | 4.197 | 17.841 | 47.163 |
| 0.616000000000079 | 4.22 | 17.902 | 47.281 |
| 0.619000000000079 | 4.244 | 17.964 | 47.399 |
| 0.622000000000079 | 4.267 | 18.026 | 47.517 |
| 0.625000000000079 | 4.291 | 18.088 | 47.635 |
| 0.628000000000079 | 4.315 | 18.15 | 47.753 |
| 0.631000000000079 | 4.339 | 18.212 | 47.872 |
| 0.634000000000079 | 4.363 | 18.275 | 47.99 |
| 0.637000000000079 | 4.387 | 18.337 | 48.109 |
| 0.640000000000079 | 4.411 | 18.4 | 48.229 |
| 0.643000000000079 | 4.435 | 18.463 | 48.348 |
| 0.646000000000079 | 4.46 | 18.525 | 48.467 |
| 0.649000000000079 | 4.484 | 18.589 | 48.587 |
| 0.652000000000079 | 4.508 | 18.652 | 48.707 |
| 0.655000000000079 | 4.533 | 18.715 | 48.827 |
| 0.658000000000079 | 4.558 | 18.779 | 48.948 |
| 0.661000000000079 | 4.583 | 18.842 | 49.068 |
| 0.664000000000079 | 4.607 | 18.906 | 49.189 |
| 0.667000000000079 | 4.632 | 18.97 | 49.31 |
| 0.670000000000079 | 4.657 | 19.034 | 49.431 |
| 0.673000000000079 | 4.683 | 19.098 | 49.552 |
| 0.676000000000079 | 4.708 | 19.163 | 49.674 |
| 0.679000000000079 | 4.733 | 19.227 | 49.795 |
| 0.682000000000079 | 4.759 | 19.292 | 49.917 |
| 0.685000000000079 | 4.784 | 19.357 | 50.039 |
| 0.688000000000079 | 4.81 | 19.422 | 50.162 |
| 0.691000000000079 | 4.835 | 19.487 | 50.284 |
| 0.694000000000079 | 4.861 | 19.552 | 50.407 |
| 0.697000000000079 | 4.887 | 19.617 | 50.53 |
| 0.700000000000079 | 4.913 | 19.683 | 50.653 |
| 0.703000000000079 | 4.939 | 19.749 | 50.776 |
| 0.706000000000079 | 4.965 | 19.815 | 50.9 |
| 0.709000000000079 | 4.991 | 19.88 | 51.024 |
| 0.712000000000079 | 5.018 | 19.947 | 51.147 |
| 0.715000000000079 | 5.044 | 20.013 | 51.272 |
| 0.718000000000079 | 5.071 | 20.079 | 51.396 |
| 0.721000000000079 | 5.097 | 20.146 | 51.52 |
| 0.724000000000079 | 5.124 | 20.213 | 51.645 |
| 0.727000000000079 | 5.151 | 20.279 | 51.77 |
| 0.730000000000079 | 5.178 | 20.346 | 51.895 |
| 0.733000000000079 | 5.205 | 20.414 | 52.02 |
| 0.736000000000079 | 5.232 | 20.481 | 52.146 |
| 0.739000000000079 | 5.259 | 20.548 | 52.272 |
| 0.742000000000079 | 5.286 | 20.616 | 52.398 |
| 0.745000000000079 | 5.314 | 20.684 | 52.524 |
| 0.748000000000079 | 5.341 | 20.752 | 52.65 |
| 0.751000000000079 | 5.369 | 20.82 | 52.777 |
| 0.754000000000079 | 5.396 | 20.888 | 52.903 |
| 0.757000000000079 | 5.424 | 20.956 | 53.03 |
| 0.760000000000079 | 5.452 | 21.025 | 53.157 |
| 0.763000000000079 | 5.48 | 21.093 | 53.285 |
| 0.766000000000079 | 5.508 | 21.162 | 53.412 |
| 0.769000000000079 | 5.536 | 21.231 | 53.54 |
| 0.772000000000079 | 5.564 | 21.3 | 53.668 |
| 0.775000000000079 | 5.592 | 21.369 | 53.796 |
| 0.778000000000079 | 5.621 | 21.439 | 53.924 |
| 0.781000000000079 | 5.649 | 21.508 | 54.053 |
| 0.784000000000079 | 5.678 | 21.578 | 54.182 |
| 0.787000000000079 | 5.707 | 21.648 | 54.311 |
| 0.790000000000079 | 5.735 | 21.718 | 54.44 |
| 0.793000000000079 | 5.764 | 21.788 | 54.569 |
| 0.796000000000079 | 5.793 | 21.858 | 54.699 |
| 0.799000000000079 | 5.822 | 21.928 | 54.829 |
| 0.802000000000079 | 5.851 | 21.999 | 54.959 |
| 0.805000000000079 | 5.881 | 22.07 | 55.089 |
| 0.808000000000079 | 5.91 | 22.141 | 55.219 |
| 0.811000000000079 | 5.94 | 22.212 | 55.35 |
| 0.814000000000079 | 5.969 | 22.283 | 55.481 |
| 0.817000000000079 | 5.999 | 22.354 | 55.612 |
| 0.820000000000079 | 6.029 | 22.426 | 55.743 |
| 0.823000000000079 | 6.058 | 22.497 | 55.874 |
| 0.826000000000079 | 6.088 | 22.569 | 56.006 |
| 0.829000000000079 | 6.118 | 22.641 | 56.138 |
| 0.832000000000079 | 6.149 | 22.713 | 56.27 |
| 0.835000000000079 | 6.179 | 22.786 | 56.402 |
| 0.838000000000079 | 6.209 | 22.858 | 56.535 |
| 0.841000000000079 | 6.24 | 22.931 | 56.667 |
| 0.844000000000079 | 6.27 | 23.003 | 56.8 |
| 0.847000000000079 | 6.301 | 23.076 | 56.933 |
| 0.850000000000079 | 6.332 | 23.149 | 57.067 |
| 0.853000000000079 | 6.362 | 23.222 | 57.2 |
| 0.856000000000079 | 6.393 | 23.296 | 57.334 |
| 0.859000000000079 | 6.424 | 23.369 | 57.468 |
| 0.862000000000079 | 6.456 | 23.443 | 57.602 |
| 0.865000000000079 | 6.487 | 23.517 | 57.736 |
| 0.868000000000079 | 6.518 | 23.591 | 57.871 |
| 0.871000000000079 | 6.55 | 23.665 | 58.006 |
| 0.874000000000079 | 6.581 | 23.739 | 58.141 |
| 0.877000000000079 | 6.613 | 23.813 | 58.276 |
| 0.880000000000079 | 6.645 | 23.888 | 58.411 |
| 0.883000000000079 | 6.677 | 23.963 | 58.547 |
| 0.886000000000079 | 6.708 | 24.037 | 58.682 |
| 0.889000000000079 | 6.741 | 24.113 | 58.818 |
| 0.892000000000079 | 6.773 | 24.188 | 58.955 |
| 0.895000000000079 | 6.805 | 24.263 | 59.091 |
| 0.898000000000079 | 6.837 | 24.339 | 59.228 |
| 0.901000000000079 | 6.87 | 24.414 | 59.365 |
| 0.904000000000079 | 6.902 | 24.49 | 59.502 |
| 0.907000000000079 | 6.935 | 24.566 | 59.639 |
| 0.910000000000079 | 6.968 | 24.642 | 59.776 |
| 0.913000000000079 | 7.001 | 24.718 | 59.914 |
| 0.916000000000079 | 7.034 | 24.795 | 60.052 |
| 0.919000000000079 | 7.067 | 24.872 | 60.19 |
| 0.922000000000079 | 7.1 | 24.948 | 60.329 |
| 0.925000000000079 | 7.133 | 25.025 | 60.467 |
| 0.928000000000079 | 7.167 | 25.102 | 60.606 |
| 0.931000000000079 | 7.2 | 25.18 | 60.745 |
| 0.934000000000079 | 7.234 | 25.257 | 60.884 |
| 0.937000000000079 | 7.268 | 25.334 | 61.023 |
| 0.940000000000079 | 7.301 | 25.412 | 61.163 |
| 0.943000000000079 | 7.335 | 25.49 | 61.303 |
| 0.946000000000079 | 7.369 | 25.568 | 61.443 |
| 0.949000000000079 | 7.403 | 25.646 | 61.583 |
| 0.952000000000079 | 7.438 | 25.725 | 61.724 |
| 0.955000000000079 | 7.472 | 25.803 | 61.864 |
| 0.958000000000079 | 7.507 | 25.882 | 62.005 |
| 0.961000000000079 | 7.541 | 25.961 | 62.146 |
| 0.964000000000079 | 7.576 | 26.04 | 62.288 |
| 0.967000000000079 | 7.61 | 26.119 | 62.429 |
| 0.970000000000079 | 7.645 | 26.198 | 62.571 |
| 0.973000000000079 | 7.68 | 26.278 | 62.713 |
| 0.976000000000079 | 7.715 | 26.357 | 62.855 |
| 0.979000000000079 | 7.751 | 26.437 | 62.997 |
| 0.982000000000079 | 7.786 | 26.517 | 63.14 |
| 0.985000000000079 | 7.821 | 26.597 | 63.283 |
| 0.988000000000079 | 7.857 | 26.677 | 63.426 |
| 0.991000000000079 | 7.892 | 26.758 | 63.569 |
| 0.994000000000079 | 7.928 | 26.838 | 63.712 |
| 0.997000000000079 | 7.964 | 26.919 | 63.856 |
| 1.00000000000008 | 8 | 27 | 64 |